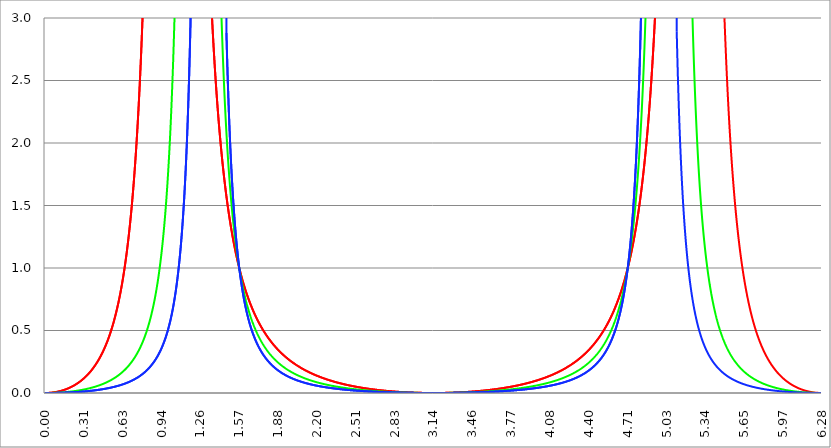
| Category | Series 1 | Series 0 | Series 2 |
|---|---|---|---|
| 0.0 | 0 | 0 | 0 |
| 0.00314159265358979 | 0 | 0 | 0 |
| 0.00628318530717958 | 0 | 0 | 0 |
| 0.00942477796076938 | 0 | 0 | 0 |
| 0.0125663706143592 | 0 | 0 | 0 |
| 0.015707963267949 | 0 | 0 | 0 |
| 0.0188495559215388 | 0 | 0 | 0 |
| 0.0219911485751285 | 0 | 0 | 0 |
| 0.0251327412287183 | 0.001 | 0 | 0 |
| 0.0282743338823081 | 0.001 | 0 | 0 |
| 0.0314159265358979 | 0.001 | 0 | 0 |
| 0.0345575191894877 | 0.001 | 0 | 0 |
| 0.0376991118430775 | 0.001 | 0 | 0 |
| 0.0408407044966673 | 0.002 | 0 | 0 |
| 0.0439822971502571 | 0.002 | 0 | 0 |
| 0.0471238898038469 | 0.002 | 0.001 | 0 |
| 0.0502654824574367 | 0.003 | 0.001 | 0 |
| 0.0534070751110265 | 0.003 | 0.001 | 0 |
| 0.0565486677646163 | 0.003 | 0.001 | 0 |
| 0.059690260418206 | 0.004 | 0.001 | 0 |
| 0.0628318530717958 | 0.004 | 0.001 | 0 |
| 0.0659734457253856 | 0.004 | 0.001 | 0 |
| 0.0691150383789754 | 0.005 | 0.001 | 0.001 |
| 0.0722566310325652 | 0.005 | 0.001 | 0.001 |
| 0.075398223686155 | 0.006 | 0.001 | 0.001 |
| 0.0785398163397448 | 0.006 | 0.002 | 0.001 |
| 0.0816814089933346 | 0.007 | 0.002 | 0.001 |
| 0.0848230016469244 | 0.007 | 0.002 | 0.001 |
| 0.0879645943005142 | 0.008 | 0.002 | 0.001 |
| 0.091106186954104 | 0.008 | 0.002 | 0.001 |
| 0.0942477796076937 | 0.009 | 0.002 | 0.001 |
| 0.0973893722612835 | 0.01 | 0.002 | 0.001 |
| 0.100530964914873 | 0.01 | 0.003 | 0.001 |
| 0.103672557568463 | 0.011 | 0.003 | 0.001 |
| 0.106814150222053 | 0.012 | 0.003 | 0.001 |
| 0.109955742875643 | 0.012 | 0.003 | 0.001 |
| 0.113097335529233 | 0.013 | 0.003 | 0.001 |
| 0.116238928182822 | 0.014 | 0.003 | 0.002 |
| 0.119380520836412 | 0.015 | 0.004 | 0.002 |
| 0.122522113490002 | 0.015 | 0.004 | 0.002 |
| 0.125663706143592 | 0.016 | 0.004 | 0.002 |
| 0.128805298797181 | 0.017 | 0.004 | 0.002 |
| 0.131946891450771 | 0.018 | 0.004 | 0.002 |
| 0.135088484104361 | 0.019 | 0.005 | 0.002 |
| 0.138230076757951 | 0.02 | 0.005 | 0.002 |
| 0.141371669411541 | 0.021 | 0.005 | 0.002 |
| 0.14451326206513 | 0.022 | 0.005 | 0.002 |
| 0.14765485471872 | 0.023 | 0.006 | 0.002 |
| 0.15079644737231 | 0.024 | 0.006 | 0.003 |
| 0.1539380400259 | 0.025 | 0.006 | 0.003 |
| 0.15707963267949 | 0.026 | 0.006 | 0.003 |
| 0.160221225333079 | 0.027 | 0.007 | 0.003 |
| 0.163362817986669 | 0.028 | 0.007 | 0.003 |
| 0.166504410640259 | 0.029 | 0.007 | 0.003 |
| 0.169646003293849 | 0.03 | 0.007 | 0.003 |
| 0.172787595947439 | 0.031 | 0.008 | 0.003 |
| 0.175929188601028 | 0.033 | 0.008 | 0.004 |
| 0.179070781254618 | 0.034 | 0.008 | 0.004 |
| 0.182212373908208 | 0.035 | 0.009 | 0.004 |
| 0.185353966561798 | 0.036 | 0.009 | 0.004 |
| 0.188495559215388 | 0.038 | 0.009 | 0.004 |
| 0.191637151868977 | 0.039 | 0.01 | 0.004 |
| 0.194778744522567 | 0.04 | 0.01 | 0.004 |
| 0.197920337176157 | 0.042 | 0.01 | 0.005 |
| 0.201061929829747 | 0.043 | 0.011 | 0.005 |
| 0.204203522483336 | 0.045 | 0.011 | 0.005 |
| 0.207345115136926 | 0.046 | 0.011 | 0.005 |
| 0.210486707790516 | 0.048 | 0.012 | 0.005 |
| 0.213628300444106 | 0.049 | 0.012 | 0.005 |
| 0.216769893097696 | 0.051 | 0.012 | 0.005 |
| 0.219911485751285 | 0.053 | 0.013 | 0.006 |
| 0.223053078404875 | 0.054 | 0.013 | 0.006 |
| 0.226194671058465 | 0.056 | 0.014 | 0.006 |
| 0.229336263712055 | 0.058 | 0.014 | 0.006 |
| 0.232477856365645 | 0.059 | 0.014 | 0.006 |
| 0.235619449019234 | 0.061 | 0.015 | 0.007 |
| 0.238761041672824 | 0.063 | 0.015 | 0.007 |
| 0.241902634326414 | 0.065 | 0.016 | 0.007 |
| 0.245044226980004 | 0.067 | 0.016 | 0.007 |
| 0.248185819633594 | 0.068 | 0.017 | 0.007 |
| 0.251327412287183 | 0.07 | 0.017 | 0.007 |
| 0.254469004940773 | 0.072 | 0.017 | 0.008 |
| 0.257610597594363 | 0.074 | 0.018 | 0.008 |
| 0.260752190247953 | 0.076 | 0.018 | 0.008 |
| 0.263893782901543 | 0.079 | 0.019 | 0.008 |
| 0.267035375555132 | 0.081 | 0.019 | 0.009 |
| 0.270176968208722 | 0.083 | 0.02 | 0.009 |
| 0.273318560862312 | 0.085 | 0.02 | 0.009 |
| 0.276460153515902 | 0.087 | 0.021 | 0.009 |
| 0.279601746169492 | 0.09 | 0.021 | 0.009 |
| 0.282743338823082 | 0.092 | 0.022 | 0.01 |
| 0.285884931476671 | 0.094 | 0.023 | 0.01 |
| 0.289026524130261 | 0.097 | 0.023 | 0.01 |
| 0.292168116783851 | 0.099 | 0.024 | 0.01 |
| 0.295309709437441 | 0.102 | 0.024 | 0.011 |
| 0.298451302091031 | 0.104 | 0.025 | 0.011 |
| 0.30159289474462 | 0.107 | 0.025 | 0.011 |
| 0.30473448739821 | 0.109 | 0.026 | 0.011 |
| 0.3078760800518 | 0.112 | 0.027 | 0.012 |
| 0.31101767270539 | 0.115 | 0.027 | 0.012 |
| 0.31415926535898 | 0.117 | 0.028 | 0.012 |
| 0.31730085801257 | 0.12 | 0.028 | 0.012 |
| 0.320442450666159 | 0.123 | 0.029 | 0.013 |
| 0.323584043319749 | 0.126 | 0.03 | 0.013 |
| 0.326725635973339 | 0.129 | 0.03 | 0.013 |
| 0.329867228626929 | 0.132 | 0.031 | 0.014 |
| 0.333008821280519 | 0.135 | 0.032 | 0.014 |
| 0.336150413934108 | 0.138 | 0.032 | 0.014 |
| 0.339292006587698 | 0.141 | 0.033 | 0.014 |
| 0.342433599241288 | 0.144 | 0.034 | 0.015 |
| 0.345575191894878 | 0.148 | 0.035 | 0.015 |
| 0.348716784548468 | 0.151 | 0.035 | 0.015 |
| 0.351858377202058 | 0.154 | 0.036 | 0.016 |
| 0.354999969855647 | 0.158 | 0.037 | 0.016 |
| 0.358141562509237 | 0.161 | 0.038 | 0.016 |
| 0.361283155162827 | 0.165 | 0.038 | 0.017 |
| 0.364424747816417 | 0.168 | 0.039 | 0.017 |
| 0.367566340470007 | 0.172 | 0.04 | 0.017 |
| 0.370707933123597 | 0.176 | 0.041 | 0.018 |
| 0.373849525777186 | 0.18 | 0.041 | 0.018 |
| 0.376991118430776 | 0.183 | 0.042 | 0.018 |
| 0.380132711084366 | 0.187 | 0.043 | 0.019 |
| 0.383274303737956 | 0.191 | 0.044 | 0.019 |
| 0.386415896391546 | 0.195 | 0.045 | 0.019 |
| 0.389557489045135 | 0.2 | 0.046 | 0.02 |
| 0.392699081698725 | 0.204 | 0.047 | 0.02 |
| 0.395840674352315 | 0.208 | 0.048 | 0.021 |
| 0.398982267005905 | 0.212 | 0.048 | 0.021 |
| 0.402123859659495 | 0.217 | 0.049 | 0.021 |
| 0.405265452313085 | 0.221 | 0.05 | 0.022 |
| 0.408407044966674 | 0.226 | 0.051 | 0.022 |
| 0.411548637620264 | 0.231 | 0.052 | 0.023 |
| 0.414690230273854 | 0.235 | 0.053 | 0.023 |
| 0.417831822927444 | 0.24 | 0.054 | 0.023 |
| 0.420973415581034 | 0.245 | 0.055 | 0.024 |
| 0.424115008234623 | 0.25 | 0.056 | 0.024 |
| 0.427256600888213 | 0.255 | 0.057 | 0.025 |
| 0.430398193541803 | 0.26 | 0.058 | 0.025 |
| 0.433539786195393 | 0.266 | 0.059 | 0.026 |
| 0.436681378848983 | 0.271 | 0.061 | 0.026 |
| 0.439822971502573 | 0.277 | 0.062 | 0.026 |
| 0.442964564156162 | 0.282 | 0.063 | 0.027 |
| 0.446106156809752 | 0.288 | 0.064 | 0.027 |
| 0.449247749463342 | 0.294 | 0.065 | 0.028 |
| 0.452389342116932 | 0.299 | 0.066 | 0.028 |
| 0.455530934770522 | 0.305 | 0.067 | 0.029 |
| 0.458672527424111 | 0.312 | 0.069 | 0.029 |
| 0.461814120077701 | 0.318 | 0.07 | 0.03 |
| 0.464955712731291 | 0.324 | 0.071 | 0.03 |
| 0.468097305384881 | 0.33 | 0.072 | 0.031 |
| 0.471238898038471 | 0.337 | 0.074 | 0.031 |
| 0.474380490692061 | 0.344 | 0.075 | 0.032 |
| 0.47752208334565 | 0.351 | 0.076 | 0.032 |
| 0.48066367599924 | 0.357 | 0.078 | 0.033 |
| 0.48380526865283 | 0.364 | 0.079 | 0.034 |
| 0.48694686130642 | 0.372 | 0.08 | 0.034 |
| 0.49008845396001 | 0.379 | 0.082 | 0.035 |
| 0.493230046613599 | 0.386 | 0.083 | 0.035 |
| 0.496371639267189 | 0.394 | 0.085 | 0.036 |
| 0.499513231920779 | 0.402 | 0.086 | 0.036 |
| 0.502654824574369 | 0.41 | 0.087 | 0.037 |
| 0.505796417227959 | 0.418 | 0.089 | 0.038 |
| 0.508938009881549 | 0.426 | 0.09 | 0.038 |
| 0.512079602535138 | 0.434 | 0.092 | 0.039 |
| 0.515221195188728 | 0.443 | 0.094 | 0.039 |
| 0.518362787842318 | 0.452 | 0.095 | 0.04 |
| 0.521504380495908 | 0.46 | 0.097 | 0.041 |
| 0.524645973149498 | 0.47 | 0.098 | 0.041 |
| 0.527787565803087 | 0.479 | 0.1 | 0.042 |
| 0.530929158456677 | 0.488 | 0.102 | 0.043 |
| 0.534070751110267 | 0.498 | 0.104 | 0.043 |
| 0.537212343763857 | 0.508 | 0.105 | 0.044 |
| 0.540353936417447 | 0.518 | 0.107 | 0.045 |
| 0.543495529071037 | 0.528 | 0.109 | 0.046 |
| 0.546637121724626 | 0.538 | 0.111 | 0.046 |
| 0.549778714378216 | 0.549 | 0.112 | 0.047 |
| 0.552920307031806 | 0.56 | 0.114 | 0.048 |
| 0.556061899685396 | 0.571 | 0.116 | 0.048 |
| 0.559203492338986 | 0.582 | 0.118 | 0.049 |
| 0.562345084992576 | 0.594 | 0.12 | 0.05 |
| 0.565486677646165 | 0.605 | 0.122 | 0.051 |
| 0.568628270299755 | 0.617 | 0.124 | 0.052 |
| 0.571769862953345 | 0.63 | 0.126 | 0.052 |
| 0.574911455606935 | 0.642 | 0.128 | 0.053 |
| 0.578053048260525 | 0.655 | 0.13 | 0.054 |
| 0.581194640914114 | 0.668 | 0.133 | 0.055 |
| 0.584336233567704 | 0.682 | 0.135 | 0.056 |
| 0.587477826221294 | 0.695 | 0.137 | 0.057 |
| 0.590619418874884 | 0.709 | 0.139 | 0.057 |
| 0.593761011528474 | 0.724 | 0.142 | 0.058 |
| 0.596902604182064 | 0.738 | 0.144 | 0.059 |
| 0.600044196835653 | 0.753 | 0.146 | 0.06 |
| 0.603185789489243 | 0.769 | 0.149 | 0.061 |
| 0.606327382142833 | 0.784 | 0.151 | 0.062 |
| 0.609468974796423 | 0.8 | 0.154 | 0.063 |
| 0.612610567450013 | 0.817 | 0.156 | 0.064 |
| 0.615752160103602 | 0.833 | 0.159 | 0.065 |
| 0.618893752757192 | 0.851 | 0.162 | 0.066 |
| 0.622035345410782 | 0.868 | 0.164 | 0.067 |
| 0.625176938064372 | 0.886 | 0.167 | 0.068 |
| 0.628318530717962 | 0.905 | 0.17 | 0.069 |
| 0.631460123371551 | 0.923 | 0.172 | 0.07 |
| 0.634601716025141 | 0.943 | 0.175 | 0.071 |
| 0.637743308678731 | 0.962 | 0.178 | 0.072 |
| 0.640884901332321 | 0.983 | 0.181 | 0.073 |
| 0.644026493985911 | 1.004 | 0.184 | 0.075 |
| 0.647168086639501 | 1.025 | 0.187 | 0.076 |
| 0.65030967929309 | 1.047 | 0.19 | 0.077 |
| 0.65345127194668 | 1.069 | 0.194 | 0.078 |
| 0.65659286460027 | 1.092 | 0.197 | 0.079 |
| 0.65973445725386 | 1.115 | 0.2 | 0.08 |
| 0.66287604990745 | 1.14 | 0.203 | 0.082 |
| 0.666017642561039 | 1.164 | 0.207 | 0.083 |
| 0.669159235214629 | 1.19 | 0.21 | 0.084 |
| 0.672300827868219 | 1.216 | 0.214 | 0.086 |
| 0.675442420521809 | 1.243 | 0.217 | 0.087 |
| 0.678584013175399 | 1.27 | 0.221 | 0.088 |
| 0.681725605828989 | 1.299 | 0.225 | 0.09 |
| 0.684867198482578 | 1.328 | 0.228 | 0.091 |
| 0.688008791136168 | 1.357 | 0.232 | 0.092 |
| 0.691150383789758 | 1.388 | 0.236 | 0.094 |
| 0.694291976443348 | 1.42 | 0.24 | 0.095 |
| 0.697433569096938 | 1.452 | 0.244 | 0.097 |
| 0.700575161750528 | 1.485 | 0.248 | 0.098 |
| 0.703716754404117 | 1.52 | 0.253 | 0.1 |
| 0.706858347057707 | 1.555 | 0.257 | 0.101 |
| 0.709999939711297 | 1.591 | 0.261 | 0.103 |
| 0.713141532364887 | 1.629 | 0.266 | 0.104 |
| 0.716283125018477 | 1.667 | 0.27 | 0.106 |
| 0.719424717672066 | 1.707 | 0.275 | 0.108 |
| 0.722566310325656 | 1.748 | 0.28 | 0.109 |
| 0.725707902979246 | 1.79 | 0.285 | 0.111 |
| 0.728849495632836 | 1.833 | 0.289 | 0.113 |
| 0.731991088286426 | 1.878 | 0.295 | 0.114 |
| 0.735132680940016 | 1.924 | 0.3 | 0.116 |
| 0.738274273593605 | 1.972 | 0.305 | 0.118 |
| 0.741415866247195 | 2.021 | 0.31 | 0.12 |
| 0.744557458900785 | 2.072 | 0.316 | 0.122 |
| 0.747699051554375 | 2.124 | 0.321 | 0.124 |
| 0.750840644207965 | 2.179 | 0.327 | 0.126 |
| 0.753982236861554 | 2.235 | 0.333 | 0.128 |
| 0.757123829515144 | 2.292 | 0.339 | 0.13 |
| 0.760265422168734 | 2.352 | 0.345 | 0.132 |
| 0.763407014822324 | 2.414 | 0.351 | 0.134 |
| 0.766548607475914 | 2.478 | 0.357 | 0.136 |
| 0.769690200129504 | 2.545 | 0.363 | 0.138 |
| 0.772831792783093 | 2.613 | 0.37 | 0.14 |
| 0.775973385436683 | 2.685 | 0.377 | 0.143 |
| 0.779114978090273 | 2.758 | 0.384 | 0.145 |
| 0.782256570743863 | 2.835 | 0.391 | 0.147 |
| 0.785398163397453 | 2.914 | 0.398 | 0.15 |
| 0.788539756051042 | 2.997 | 0.405 | 0.152 |
| 0.791681348704632 | 3.082 | 0.412 | 0.154 |
| 0.794822941358222 | 3.171 | 0.42 | 0.157 |
| 0.797964534011812 | 3.263 | 0.428 | 0.159 |
| 0.801106126665402 | 3.359 | 0.436 | 0.162 |
| 0.804247719318992 | 3.459 | 0.444 | 0.165 |
| 0.807389311972581 | 3.563 | 0.452 | 0.167 |
| 0.810530904626171 | 3.671 | 0.461 | 0.17 |
| 0.813672497279761 | 3.783 | 0.47 | 0.173 |
| 0.816814089933351 | 3.901 | 0.479 | 0.176 |
| 0.819955682586941 | 4.023 | 0.488 | 0.179 |
| 0.823097275240531 | 4.151 | 0.497 | 0.182 |
| 0.82623886789412 | 4.284 | 0.507 | 0.185 |
| 0.82938046054771 | 4.423 | 0.517 | 0.188 |
| 0.8325220532013 | 4.569 | 0.527 | 0.191 |
| 0.83566364585489 | 4.721 | 0.537 | 0.194 |
| 0.83880523850848 | 4.881 | 0.548 | 0.198 |
| 0.841946831162069 | 5.047 | 0.559 | 0.201 |
| 0.845088423815659 | 5.222 | 0.57 | 0.204 |
| 0.848230016469249 | 5.406 | 0.581 | 0.208 |
| 0.851371609122839 | 5.598 | 0.593 | 0.211 |
| 0.854513201776429 | 5.801 | 0.605 | 0.215 |
| 0.857654794430019 | 6.013 | 0.617 | 0.219 |
| 0.860796387083608 | 6.237 | 0.63 | 0.223 |
| 0.863937979737198 | 6.472 | 0.643 | 0.226 |
| 0.867079572390788 | 6.72 | 0.656 | 0.23 |
| 0.870221165044378 | 6.982 | 0.67 | 0.235 |
| 0.873362757697968 | 7.258 | 0.684 | 0.239 |
| 0.876504350351557 | 7.55 | 0.699 | 0.243 |
| 0.879645943005147 | 7.859 | 0.713 | 0.247 |
| 0.882787535658737 | 8.186 | 0.729 | 0.252 |
| 0.885929128312327 | 8.533 | 0.744 | 0.256 |
| 0.889070720965917 | 8.901 | 0.76 | 0.261 |
| 0.892212313619507 | 9.292 | 0.777 | 0.266 |
| 0.895353906273096 | 9.707 | 0.794 | 0.27 |
| 0.898495498926686 | 10.15 | 0.812 | 0.275 |
| 0.901637091580276 | 10.623 | 0.83 | 0.28 |
| 0.904778684233866 | 11.127 | 0.849 | 0.286 |
| 0.907920276887456 | 11.666 | 0.868 | 0.291 |
| 0.911061869541045 | 12.244 | 0.888 | 0.296 |
| 0.914203462194635 | 12.864 | 0.908 | 0.302 |
| 0.917345054848225 | 13.53 | 0.929 | 0.308 |
| 0.920486647501815 | 14.246 | 0.951 | 0.313 |
| 0.923628240155405 | 15.019 | 0.973 | 0.319 |
| 0.926769832808995 | 15.854 | 0.996 | 0.325 |
| 0.929911425462584 | 16.758 | 1.02 | 0.332 |
| 0.933053018116174 | 17.738 | 1.044 | 0.338 |
| 0.936194610769764 | 18.803 | 1.07 | 0.345 |
| 0.939336203423354 | 19.965 | 1.096 | 0.352 |
| 0.942477796076944 | 21.233 | 1.123 | 0.359 |
| 0.945619388730533 | 22.622 | 1.151 | 0.366 |
| 0.948760981384123 | 24.148 | 1.18 | 0.373 |
| 0.951902574037713 | 25.829 | 1.21 | 0.38 |
| 0.955044166691303 | 27.686 | 1.241 | 0.388 |
| 0.958185759344893 | 29.746 | 1.273 | 0.396 |
| 0.961327351998483 | 32.037 | 1.307 | 0.404 |
| 0.964468944652072 | 34.597 | 1.341 | 0.413 |
| 0.967610537305662 | 37.469 | 1.377 | 0.421 |
| 0.970752129959252 | 40.705 | 1.414 | 0.43 |
| 0.973893722612842 | 44.37 | 1.453 | 0.439 |
| 0.977035315266432 | 48.541 | 1.492 | 0.448 |
| 0.980176907920022 | 53.317 | 1.534 | 0.458 |
| 0.983318500573611 | 58.82 | 1.577 | 0.468 |
| 0.986460093227201 | 65.205 | 1.622 | 0.478 |
| 0.989601685880791 | 72.67 | 1.668 | 0.488 |
| 0.992743278534381 | 81.472 | 1.717 | 0.499 |
| 0.995884871187971 | 91.949 | 1.767 | 0.51 |
| 0.99902646384156 | 104.554 | 1.82 | 0.522 |
| 1.00216805649515 | 119.903 | 1.875 | 0.533 |
| 1.00530964914874 | 138.85 | 1.932 | 0.545 |
| 1.00845124180233 | 162.613 | 1.991 | 0.558 |
| 1.01159283445592 | 192.967 | 2.054 | 0.571 |
| 1.01473442710951 | 232.591 | 2.118 | 0.584 |
| 1.017876019763099 | 285.672 | 2.186 | 0.598 |
| 1.021017612416689 | 359.056 | 2.257 | 0.612 |
| 1.02415920507028 | 464.566 | 2.332 | 0.627 |
| 1.027300797723869 | 624.062 | 2.41 | 0.642 |
| 1.030442390377459 | 881.716 | 2.491 | 0.657 |
| 1.033583983031048 | 1338.161 | 2.577 | 0.673 |
| 1.036725575684638 | 2265.756 | 2.666 | 0.69 |
| 1.039867168338228 | 4632.626 | 2.761 | 0.707 |
| 1.043008760991818 | 14213.646 | 2.86 | 0.725 |
| 1.046150353645408 | 227834.643 | 2.964 | 0.744 |
| 1.049291946298998 | 57061.894 | 3.074 | 0.763 |
| 1.052433538952587 | 9146.285 | 3.19 | 0.783 |
| 1.055575131606177 | 3579.114 | 3.312 | 0.803 |
| 1.058716724259767 | 1896.414 | 3.44 | 0.825 |
| 1.061858316913357 | 1172.783 | 3.577 | 0.847 |
| 1.064999909566947 | 796.753 | 3.721 | 0.87 |
| 1.068141502220536 | 576.636 | 3.873 | 0.894 |
| 1.071283094874126 | 436.755 | 4.035 | 0.918 |
| 1.074424687527716 | 342.351 | 4.207 | 0.944 |
| 1.077566280181306 | 275.638 | 4.389 | 0.971 |
| 1.080707872834896 | 226.749 | 4.583 | 0.999 |
| 1.083849465488486 | 189.85 | 4.79 | 1.028 |
| 1.086991058142075 | 161.315 | 5.011 | 1.058 |
| 1.090132650795665 | 138.791 | 5.247 | 1.09 |
| 1.093274243449255 | 120.699 | 5.499 | 1.122 |
| 1.096415836102845 | 105.946 | 5.769 | 1.157 |
| 1.099557428756435 | 93.758 | 6.059 | 1.192 |
| 1.102699021410025 | 83.57 | 6.371 | 1.23 |
| 1.105840614063614 | 74.969 | 6.707 | 1.269 |
| 1.108982206717204 | 67.639 | 7.069 | 1.31 |
| 1.112123799370794 | 61.341 | 7.46 | 1.352 |
| 1.115265392024384 | 55.89 | 7.885 | 1.397 |
| 1.118406984677974 | 51.141 | 8.345 | 1.444 |
| 1.121548577331563 | 46.977 | 8.846 | 1.493 |
| 1.124690169985153 | 43.306 | 9.392 | 1.545 |
| 1.127831762638743 | 40.052 | 9.989 | 1.599 |
| 1.130973355292333 | 37.155 | 10.644 | 1.656 |
| 1.134114947945923 | 34.565 | 11.364 | 1.716 |
| 1.137256540599513 | 32.238 | 12.158 | 1.779 |
| 1.140398133253102 | 30.141 | 13.037 | 1.846 |
| 1.143539725906692 | 28.244 | 14.013 | 1.916 |
| 1.146681318560282 | 26.523 | 15.1 | 1.99 |
| 1.149822911213872 | 24.955 | 16.317 | 2.068 |
| 1.152964503867462 | 23.524 | 17.684 | 2.151 |
| 1.156106096521051 | 22.214 | 19.229 | 2.239 |
| 1.159247689174641 | 21.012 | 20.981 | 2.332 |
| 1.162389281828231 | 19.905 | 22.981 | 2.431 |
| 1.165530874481821 | 18.885 | 25.277 | 2.536 |
| 1.168672467135411 | 17.942 | 27.931 | 2.648 |
| 1.171814059789001 | 17.068 | 31.021 | 2.767 |
| 1.17495565244259 | 16.258 | 34.647 | 2.894 |
| 1.17809724509618 | 15.504 | 38.941 | 3.03 |
| 1.18123883774977 | 14.803 | 44.078 | 3.176 |
| 1.18438043040336 | 14.148 | 50.292 | 3.331 |
| 1.18752202305695 | 13.536 | 57.907 | 3.499 |
| 1.190663615710539 | 12.964 | 67.376 | 3.678 |
| 1.193805208364129 | 12.427 | 79.355 | 3.872 |
| 1.19694680101772 | 11.924 | 94.813 | 4.081 |
| 1.200088393671309 | 11.45 | 115.238 | 4.307 |
| 1.203229986324899 | 11.005 | 143.008 | 4.552 |
| 1.206371578978489 | 10.585 | 182.113 | 4.818 |
| 1.209513171632078 | 10.189 | 239.667 | 5.108 |
| 1.212654764285668 | 9.816 | 329.392 | 5.424 |
| 1.215796356939258 | 9.462 | 480.595 | 5.77 |
| 1.218937949592848 | 9.128 | 765.506 | 6.149 |
| 1.222079542246438 | 8.811 | 1404.605 | 6.566 |
| 1.225221134900027 | 8.51 | 3367.454 | 7.026 |
| 1.228362727553617 | 8.225 | 16463.282 | 7.536 |
| 1.231504320207207 | 7.954 | 374285.39 | 8.103 |
| 1.234645912860797 | 7.696 | 8186.375 | 8.735 |
| 1.237787505514387 | 7.451 | 2388.869 | 9.442 |
| 1.240929098167977 | 7.217 | 1121.742 | 10.239 |
| 1.244070690821566 | 6.994 | 649.269 | 11.139 |
| 1.247212283475156 | 6.782 | 422.967 | 12.162 |
| 1.250353876128746 | 6.579 | 297.342 | 13.331 |
| 1.253495468782336 | 6.385 | 220.443 | 14.675 |
| 1.256637061435926 | 6.2 | 169.971 | 16.231 |
| 1.259778654089515 | 6.022 | 135.066 | 18.046 |
| 1.262920246743105 | 5.852 | 109.925 | 20.18 |
| 1.266061839396695 | 5.69 | 91.216 | 22.713 |
| 1.269203432050285 | 5.534 | 76.918 | 25.751 |
| 1.272345024703875 | 5.384 | 65.744 | 29.438 |
| 1.275486617357465 | 5.24 | 56.846 | 33.971 |
| 1.278628210011054 | 5.102 | 49.644 | 39.631 |
| 1.281769802664644 | 4.97 | 43.733 | 46.824 |
| 1.284911395318234 | 4.842 | 38.822 | 56.158 |
| 1.288052987971824 | 4.72 | 34.697 | 68.574 |
| 1.291194580625414 | 4.602 | 31.198 | 85.593 |
| 1.294336173279003 | 4.488 | 28.205 | 109.804 |
| 1.297477765932593 | 4.379 | 25.624 | 145.91 |
| 1.300619358586183 | 4.273 | 23.384 | 203.193 |
| 1.303760951239773 | 4.172 | 21.426 | 302.129 |
| 1.306902543893363 | 4.073 | 19.705 | 495.563 |
| 1.310044136546953 | 3.979 | 18.184 | 957.192 |
| 1.313185729200542 | 3.887 | 16.834 | 2567.825 |
| 1.316327321854132 | 3.799 | 15.629 | 19524.47 |
| 1.319468914507722 | 3.714 | 14.549 | 34161.462 |
| 1.322610507161312 | 3.631 | 13.578 | 3097.615 |
| 1.325752099814902 | 3.551 | 12.702 | 1073.948 |
| 1.328893692468491 | 3.474 | 11.908 | 539.519 |
| 1.332035285122081 | 3.399 | 11.187 | 323.706 |
| 1.335176877775671 | 3.327 | 10.529 | 215.627 |
| 1.338318470429261 | 3.257 | 9.928 | 153.891 |
| 1.341460063082851 | 3.189 | 9.377 | 115.34 |
| 1.344601655736441 | 3.123 | 8.871 | 89.663 |
| 1.34774324839003 | 3.059 | 8.405 | 71.705 |
| 1.35088484104362 | 2.997 | 7.975 | 58.655 |
| 1.35402643369721 | 2.937 | 7.578 | 48.873 |
| 1.3571680263508 | 2.879 | 7.209 | 41.353 |
| 1.36030961900439 | 2.822 | 6.867 | 35.446 |
| 1.363451211657979 | 2.767 | 6.548 | 30.723 |
| 1.36659280431157 | 2.714 | 6.252 | 26.886 |
| 1.369734396965159 | 2.662 | 5.975 | 23.727 |
| 1.372875989618749 | 2.611 | 5.716 | 21.095 |
| 1.376017582272339 | 2.562 | 5.473 | 18.878 |
| 1.379159174925929 | 2.515 | 5.246 | 16.994 |
| 1.382300767579518 | 2.468 | 5.033 | 15.38 |
| 1.385442360233108 | 2.423 | 4.832 | 13.985 |
| 1.388583952886698 | 2.379 | 4.643 | 12.773 |
| 1.391725545540288 | 2.336 | 4.466 | 11.711 |
| 1.394867138193878 | 2.295 | 4.298 | 10.777 |
| 1.398008730847468 | 2.254 | 4.139 | 9.951 |
| 1.401150323501057 | 2.215 | 3.989 | 9.217 |
| 1.404291916154647 | 2.176 | 3.847 | 8.561 |
| 1.407433508808237 | 2.138 | 3.713 | 7.972 |
| 1.410575101461827 | 2.102 | 3.585 | 7.443 |
| 1.413716694115417 | 2.066 | 3.464 | 6.964 |
| 1.416858286769006 | 2.031 | 3.349 | 6.531 |
| 1.419999879422596 | 1.997 | 3.239 | 6.137 |
| 1.423141472076186 | 1.964 | 3.135 | 5.777 |
| 1.426283064729776 | 1.932 | 3.036 | 5.448 |
| 1.429424657383366 | 1.9 | 2.941 | 5.147 |
| 1.432566250036956 | 1.869 | 2.851 | 4.87 |
| 1.435707842690545 | 1.839 | 2.764 | 4.614 |
| 1.438849435344135 | 1.81 | 2.682 | 4.379 |
| 1.441991027997725 | 1.781 | 2.603 | 4.16 |
| 1.445132620651315 | 1.753 | 2.528 | 3.958 |
| 1.448274213304905 | 1.726 | 2.456 | 3.77 |
| 1.451415805958494 | 1.699 | 2.387 | 3.596 |
| 1.454557398612084 | 1.672 | 2.32 | 3.433 |
| 1.457698991265674 | 1.647 | 2.257 | 3.281 |
| 1.460840583919264 | 1.622 | 2.196 | 3.138 |
| 1.463982176572854 | 1.597 | 2.137 | 3.005 |
| 1.467123769226444 | 1.573 | 2.081 | 2.88 |
| 1.470265361880033 | 1.55 | 2.027 | 2.763 |
| 1.473406954533623 | 1.527 | 1.974 | 2.653 |
| 1.476548547187213 | 1.504 | 1.924 | 2.549 |
| 1.479690139840803 | 1.482 | 1.876 | 2.451 |
| 1.482831732494393 | 1.46 | 1.83 | 2.359 |
| 1.485973325147982 | 1.439 | 1.785 | 2.272 |
| 1.489114917801572 | 1.419 | 1.742 | 2.189 |
| 1.492256510455162 | 1.398 | 1.7 | 2.111 |
| 1.495398103108752 | 1.378 | 1.66 | 2.037 |
| 1.498539695762342 | 1.359 | 1.621 | 1.967 |
| 1.501681288415932 | 1.34 | 1.583 | 1.9 |
| 1.504822881069521 | 1.321 | 1.547 | 1.837 |
| 1.507964473723111 | 1.303 | 1.512 | 1.776 |
| 1.511106066376701 | 1.285 | 1.478 | 1.719 |
| 1.514247659030291 | 1.267 | 1.445 | 1.664 |
| 1.517389251683881 | 1.25 | 1.414 | 1.612 |
| 1.520530844337471 | 1.233 | 1.383 | 1.562 |
| 1.52367243699106 | 1.216 | 1.353 | 1.515 |
| 1.52681402964465 | 1.2 | 1.324 | 1.47 |
| 1.52995562229824 | 1.184 | 1.296 | 1.426 |
| 1.53309721495183 | 1.168 | 1.269 | 1.385 |
| 1.53623880760542 | 1.153 | 1.243 | 1.345 |
| 1.539380400259009 | 1.137 | 1.218 | 1.307 |
| 1.542521992912599 | 1.123 | 1.193 | 1.27 |
| 1.545663585566189 | 1.108 | 1.169 | 1.235 |
| 1.548805178219779 | 1.094 | 1.146 | 1.202 |
| 1.551946770873369 | 1.079 | 1.123 | 1.169 |
| 1.555088363526959 | 1.066 | 1.101 | 1.138 |
| 1.558229956180548 | 1.052 | 1.08 | 1.108 |
| 1.561371548834138 | 1.039 | 1.059 | 1.08 |
| 1.564513141487728 | 1.026 | 1.039 | 1.052 |
| 1.567654734141318 | 1.013 | 1.019 | 1.026 |
| 1.570796326794908 | 1 | 1 | 1 |
| 1.573937919448497 | 0.988 | 0.981 | 0.975 |
| 1.577079512102087 | 0.975 | 0.963 | 0.952 |
| 1.580221104755677 | 0.963 | 0.946 | 0.929 |
| 1.583362697409267 | 0.951 | 0.929 | 0.906 |
| 1.586504290062857 | 0.94 | 0.912 | 0.885 |
| 1.589645882716447 | 0.928 | 0.896 | 0.864 |
| 1.592787475370036 | 0.917 | 0.88 | 0.844 |
| 1.595929068023626 | 0.906 | 0.864 | 0.825 |
| 1.599070660677216 | 0.895 | 0.849 | 0.806 |
| 1.602212253330806 | 0.884 | 0.834 | 0.788 |
| 1.605353845984396 | 0.874 | 0.82 | 0.771 |
| 1.608495438637985 | 0.863 | 0.806 | 0.754 |
| 1.611637031291575 | 0.853 | 0.792 | 0.738 |
| 1.614778623945165 | 0.843 | 0.779 | 0.722 |
| 1.617920216598755 | 0.833 | 0.766 | 0.706 |
| 1.621061809252345 | 0.824 | 0.753 | 0.692 |
| 1.624203401905935 | 0.814 | 0.741 | 0.677 |
| 1.627344994559524 | 0.805 | 0.729 | 0.663 |
| 1.630486587213114 | 0.795 | 0.717 | 0.649 |
| 1.633628179866704 | 0.786 | 0.705 | 0.636 |
| 1.636769772520294 | 0.777 | 0.694 | 0.623 |
| 1.639911365173884 | 0.768 | 0.683 | 0.611 |
| 1.643052957827473 | 0.76 | 0.672 | 0.599 |
| 1.646194550481063 | 0.751 | 0.662 | 0.587 |
| 1.649336143134653 | 0.743 | 0.651 | 0.576 |
| 1.652477735788243 | 0.734 | 0.641 | 0.565 |
| 1.655619328441833 | 0.726 | 0.631 | 0.554 |
| 1.658760921095423 | 0.718 | 0.622 | 0.543 |
| 1.661902513749012 | 0.71 | 0.612 | 0.533 |
| 1.665044106402602 | 0.702 | 0.603 | 0.523 |
| 1.668185699056192 | 0.694 | 0.594 | 0.513 |
| 1.671327291709782 | 0.687 | 0.585 | 0.504 |
| 1.674468884363372 | 0.679 | 0.576 | 0.495 |
| 1.677610477016961 | 0.672 | 0.568 | 0.486 |
| 1.680752069670551 | 0.664 | 0.559 | 0.477 |
| 1.683893662324141 | 0.657 | 0.551 | 0.469 |
| 1.687035254977731 | 0.65 | 0.543 | 0.46 |
| 1.690176847631321 | 0.643 | 0.535 | 0.452 |
| 1.693318440284911 | 0.636 | 0.527 | 0.444 |
| 1.6964600329385 | 0.629 | 0.52 | 0.437 |
| 1.69960162559209 | 0.623 | 0.512 | 0.429 |
| 1.70274321824568 | 0.616 | 0.505 | 0.422 |
| 1.70588481089927 | 0.609 | 0.498 | 0.415 |
| 1.70902640355286 | 0.603 | 0.491 | 0.408 |
| 1.712167996206449 | 0.597 | 0.484 | 0.401 |
| 1.715309588860039 | 0.59 | 0.478 | 0.394 |
| 1.71845118151363 | 0.584 | 0.471 | 0.388 |
| 1.721592774167219 | 0.578 | 0.464 | 0.381 |
| 1.724734366820809 | 0.572 | 0.458 | 0.375 |
| 1.727875959474399 | 0.566 | 0.452 | 0.369 |
| 1.731017552127988 | 0.56 | 0.446 | 0.363 |
| 1.734159144781578 | 0.554 | 0.44 | 0.357 |
| 1.737300737435168 | 0.549 | 0.434 | 0.352 |
| 1.740442330088758 | 0.543 | 0.428 | 0.346 |
| 1.743583922742348 | 0.537 | 0.422 | 0.341 |
| 1.746725515395937 | 0.532 | 0.417 | 0.335 |
| 1.749867108049527 | 0.526 | 0.411 | 0.33 |
| 1.753008700703117 | 0.521 | 0.406 | 0.325 |
| 1.756150293356707 | 0.516 | 0.401 | 0.32 |
| 1.759291886010297 | 0.511 | 0.395 | 0.315 |
| 1.762433478663887 | 0.505 | 0.39 | 0.31 |
| 1.765575071317476 | 0.5 | 0.385 | 0.306 |
| 1.768716663971066 | 0.495 | 0.38 | 0.301 |
| 1.771858256624656 | 0.49 | 0.375 | 0.297 |
| 1.774999849278246 | 0.485 | 0.371 | 0.292 |
| 1.778141441931836 | 0.48 | 0.366 | 0.288 |
| 1.781283034585426 | 0.476 | 0.361 | 0.284 |
| 1.784424627239015 | 0.471 | 0.357 | 0.28 |
| 1.787566219892605 | 0.466 | 0.352 | 0.276 |
| 1.790707812546195 | 0.462 | 0.348 | 0.272 |
| 1.793849405199785 | 0.457 | 0.344 | 0.268 |
| 1.796990997853375 | 0.453 | 0.339 | 0.264 |
| 1.800132590506964 | 0.448 | 0.335 | 0.26 |
| 1.803274183160554 | 0.444 | 0.331 | 0.256 |
| 1.806415775814144 | 0.439 | 0.327 | 0.253 |
| 1.809557368467734 | 0.435 | 0.323 | 0.249 |
| 1.812698961121324 | 0.431 | 0.319 | 0.246 |
| 1.815840553774914 | 0.427 | 0.315 | 0.242 |
| 1.818982146428503 | 0.423 | 0.311 | 0.239 |
| 1.822123739082093 | 0.418 | 0.308 | 0.236 |
| 1.825265331735683 | 0.414 | 0.304 | 0.233 |
| 1.828406924389273 | 0.41 | 0.3 | 0.229 |
| 1.831548517042863 | 0.406 | 0.297 | 0.226 |
| 1.834690109696452 | 0.402 | 0.293 | 0.223 |
| 1.837831702350042 | 0.399 | 0.29 | 0.22 |
| 1.840973295003632 | 0.395 | 0.286 | 0.217 |
| 1.844114887657222 | 0.391 | 0.283 | 0.214 |
| 1.847256480310812 | 0.387 | 0.28 | 0.212 |
| 1.850398072964402 | 0.384 | 0.276 | 0.209 |
| 1.853539665617991 | 0.38 | 0.273 | 0.206 |
| 1.856681258271581 | 0.376 | 0.27 | 0.203 |
| 1.859822850925171 | 0.373 | 0.267 | 0.201 |
| 1.862964443578761 | 0.369 | 0.264 | 0.198 |
| 1.866106036232351 | 0.366 | 0.261 | 0.195 |
| 1.86924762888594 | 0.362 | 0.258 | 0.193 |
| 1.87238922153953 | 0.359 | 0.255 | 0.19 |
| 1.87553081419312 | 0.355 | 0.252 | 0.188 |
| 1.87867240684671 | 0.352 | 0.249 | 0.186 |
| 1.8818139995003 | 0.349 | 0.246 | 0.183 |
| 1.88495559215389 | 0.345 | 0.244 | 0.181 |
| 1.888097184807479 | 0.342 | 0.241 | 0.179 |
| 1.891238777461069 | 0.339 | 0.238 | 0.176 |
| 1.89438037011466 | 0.336 | 0.235 | 0.174 |
| 1.897521962768249 | 0.333 | 0.233 | 0.172 |
| 1.900663555421839 | 0.33 | 0.23 | 0.17 |
| 1.903805148075429 | 0.327 | 0.228 | 0.168 |
| 1.906946740729018 | 0.324 | 0.225 | 0.166 |
| 1.910088333382608 | 0.321 | 0.223 | 0.164 |
| 1.913229926036198 | 0.318 | 0.22 | 0.162 |
| 1.916371518689788 | 0.315 | 0.218 | 0.16 |
| 1.919513111343378 | 0.312 | 0.215 | 0.158 |
| 1.922654703996967 | 0.309 | 0.213 | 0.156 |
| 1.925796296650557 | 0.306 | 0.211 | 0.154 |
| 1.928937889304147 | 0.303 | 0.208 | 0.152 |
| 1.932079481957737 | 0.3 | 0.206 | 0.15 |
| 1.935221074611327 | 0.298 | 0.204 | 0.148 |
| 1.938362667264917 | 0.295 | 0.202 | 0.147 |
| 1.941504259918506 | 0.292 | 0.199 | 0.145 |
| 1.944645852572096 | 0.289 | 0.197 | 0.143 |
| 1.947787445225686 | 0.287 | 0.195 | 0.141 |
| 1.950929037879276 | 0.284 | 0.193 | 0.14 |
| 1.954070630532866 | 0.282 | 0.191 | 0.138 |
| 1.957212223186455 | 0.279 | 0.189 | 0.136 |
| 1.960353815840045 | 0.276 | 0.187 | 0.135 |
| 1.963495408493635 | 0.274 | 0.185 | 0.133 |
| 1.966637001147225 | 0.271 | 0.183 | 0.132 |
| 1.969778593800815 | 0.269 | 0.181 | 0.13 |
| 1.972920186454405 | 0.266 | 0.179 | 0.129 |
| 1.976061779107994 | 0.264 | 0.177 | 0.127 |
| 1.979203371761584 | 0.262 | 0.175 | 0.126 |
| 1.982344964415174 | 0.259 | 0.174 | 0.124 |
| 1.985486557068764 | 0.257 | 0.172 | 0.123 |
| 1.988628149722354 | 0.255 | 0.17 | 0.121 |
| 1.991769742375943 | 0.252 | 0.168 | 0.12 |
| 1.994911335029533 | 0.25 | 0.166 | 0.119 |
| 1.998052927683123 | 0.248 | 0.165 | 0.117 |
| 2.001194520336712 | 0.245 | 0.163 | 0.116 |
| 2.004336112990302 | 0.243 | 0.161 | 0.115 |
| 2.007477705643892 | 0.241 | 0.16 | 0.113 |
| 2.010619298297482 | 0.239 | 0.158 | 0.112 |
| 2.013760890951071 | 0.237 | 0.156 | 0.111 |
| 2.016902483604661 | 0.235 | 0.155 | 0.11 |
| 2.02004407625825 | 0.232 | 0.153 | 0.108 |
| 2.02318566891184 | 0.23 | 0.151 | 0.107 |
| 2.02632726156543 | 0.228 | 0.15 | 0.106 |
| 2.029468854219019 | 0.226 | 0.148 | 0.105 |
| 2.032610446872609 | 0.224 | 0.147 | 0.104 |
| 2.035752039526198 | 0.222 | 0.145 | 0.102 |
| 2.038893632179788 | 0.22 | 0.144 | 0.101 |
| 2.042035224833378 | 0.218 | 0.142 | 0.1 |
| 2.045176817486967 | 0.216 | 0.141 | 0.099 |
| 2.048318410140557 | 0.214 | 0.139 | 0.098 |
| 2.051460002794146 | 0.212 | 0.138 | 0.097 |
| 2.054601595447736 | 0.21 | 0.137 | 0.096 |
| 2.057743188101325 | 0.208 | 0.135 | 0.095 |
| 2.060884780754915 | 0.207 | 0.134 | 0.094 |
| 2.064026373408505 | 0.205 | 0.132 | 0.093 |
| 2.067167966062094 | 0.203 | 0.131 | 0.092 |
| 2.070309558715684 | 0.201 | 0.13 | 0.091 |
| 2.073451151369273 | 0.199 | 0.128 | 0.09 |
| 2.076592744022863 | 0.197 | 0.127 | 0.089 |
| 2.079734336676452 | 0.196 | 0.126 | 0.088 |
| 2.082875929330042 | 0.194 | 0.125 | 0.087 |
| 2.086017521983632 | 0.192 | 0.123 | 0.086 |
| 2.089159114637221 | 0.19 | 0.122 | 0.085 |
| 2.092300707290811 | 0.189 | 0.121 | 0.084 |
| 2.095442299944401 | 0.187 | 0.12 | 0.083 |
| 2.09858389259799 | 0.185 | 0.118 | 0.082 |
| 2.10172548525158 | 0.184 | 0.117 | 0.081 |
| 2.104867077905169 | 0.182 | 0.116 | 0.08 |
| 2.108008670558759 | 0.18 | 0.115 | 0.08 |
| 2.111150263212349 | 0.179 | 0.114 | 0.079 |
| 2.114291855865938 | 0.177 | 0.113 | 0.078 |
| 2.117433448519528 | 0.175 | 0.111 | 0.077 |
| 2.120575041173117 | 0.174 | 0.11 | 0.076 |
| 2.123716633826707 | 0.172 | 0.109 | 0.075 |
| 2.126858226480297 | 0.171 | 0.108 | 0.075 |
| 2.129999819133886 | 0.169 | 0.107 | 0.074 |
| 2.133141411787476 | 0.168 | 0.106 | 0.073 |
| 2.136283004441065 | 0.166 | 0.105 | 0.072 |
| 2.139424597094655 | 0.165 | 0.104 | 0.071 |
| 2.142566189748245 | 0.163 | 0.103 | 0.071 |
| 2.145707782401834 | 0.162 | 0.102 | 0.07 |
| 2.148849375055424 | 0.16 | 0.101 | 0.069 |
| 2.151990967709013 | 0.159 | 0.1 | 0.068 |
| 2.155132560362603 | 0.157 | 0.099 | 0.068 |
| 2.158274153016193 | 0.156 | 0.098 | 0.067 |
| 2.161415745669782 | 0.154 | 0.097 | 0.066 |
| 2.164557338323372 | 0.153 | 0.096 | 0.066 |
| 2.167698930976961 | 0.152 | 0.095 | 0.065 |
| 2.170840523630551 | 0.15 | 0.094 | 0.064 |
| 2.173982116284141 | 0.149 | 0.093 | 0.063 |
| 2.17712370893773 | 0.147 | 0.092 | 0.063 |
| 2.18026530159132 | 0.146 | 0.091 | 0.062 |
| 2.183406894244909 | 0.145 | 0.09 | 0.061 |
| 2.186548486898499 | 0.143 | 0.089 | 0.061 |
| 2.189690079552089 | 0.142 | 0.088 | 0.06 |
| 2.192831672205678 | 0.141 | 0.087 | 0.06 |
| 2.195973264859268 | 0.14 | 0.087 | 0.059 |
| 2.199114857512857 | 0.138 | 0.086 | 0.058 |
| 2.202256450166447 | 0.137 | 0.085 | 0.058 |
| 2.205398042820036 | 0.136 | 0.084 | 0.057 |
| 2.208539635473626 | 0.134 | 0.083 | 0.056 |
| 2.211681228127216 | 0.133 | 0.082 | 0.056 |
| 2.214822820780805 | 0.132 | 0.081 | 0.055 |
| 2.217964413434395 | 0.131 | 0.081 | 0.055 |
| 2.221106006087984 | 0.13 | 0.08 | 0.054 |
| 2.224247598741574 | 0.128 | 0.079 | 0.054 |
| 2.227389191395164 | 0.127 | 0.078 | 0.053 |
| 2.230530784048753 | 0.126 | 0.077 | 0.052 |
| 2.233672376702343 | 0.125 | 0.077 | 0.052 |
| 2.236813969355933 | 0.124 | 0.076 | 0.051 |
| 2.239955562009522 | 0.123 | 0.075 | 0.051 |
| 2.243097154663112 | 0.121 | 0.074 | 0.05 |
| 2.246238747316701 | 0.12 | 0.074 | 0.05 |
| 2.249380339970291 | 0.119 | 0.073 | 0.049 |
| 2.252521932623881 | 0.118 | 0.072 | 0.049 |
| 2.25566352527747 | 0.117 | 0.071 | 0.048 |
| 2.25880511793106 | 0.116 | 0.071 | 0.048 |
| 2.261946710584649 | 0.115 | 0.07 | 0.047 |
| 2.265088303238239 | 0.114 | 0.069 | 0.047 |
| 2.268229895891829 | 0.113 | 0.069 | 0.046 |
| 2.271371488545418 | 0.112 | 0.068 | 0.046 |
| 2.274513081199008 | 0.11 | 0.067 | 0.045 |
| 2.277654673852597 | 0.109 | 0.067 | 0.045 |
| 2.280796266506186 | 0.108 | 0.066 | 0.044 |
| 2.283937859159776 | 0.107 | 0.065 | 0.044 |
| 2.287079451813366 | 0.106 | 0.065 | 0.043 |
| 2.290221044466955 | 0.105 | 0.064 | 0.043 |
| 2.293362637120545 | 0.104 | 0.063 | 0.042 |
| 2.296504229774135 | 0.103 | 0.063 | 0.042 |
| 2.299645822427724 | 0.102 | 0.062 | 0.041 |
| 2.302787415081314 | 0.101 | 0.061 | 0.041 |
| 2.305929007734904 | 0.1 | 0.061 | 0.041 |
| 2.309070600388493 | 0.099 | 0.06 | 0.04 |
| 2.312212193042083 | 0.098 | 0.059 | 0.04 |
| 2.315353785695672 | 0.097 | 0.059 | 0.039 |
| 2.318495378349262 | 0.097 | 0.058 | 0.039 |
| 2.321636971002852 | 0.096 | 0.058 | 0.038 |
| 2.324778563656441 | 0.095 | 0.057 | 0.038 |
| 2.327920156310031 | 0.094 | 0.056 | 0.038 |
| 2.33106174896362 | 0.093 | 0.056 | 0.037 |
| 2.33420334161721 | 0.092 | 0.055 | 0.037 |
| 2.3373449342708 | 0.091 | 0.055 | 0.036 |
| 2.340486526924389 | 0.09 | 0.054 | 0.036 |
| 2.343628119577979 | 0.089 | 0.054 | 0.036 |
| 2.346769712231568 | 0.088 | 0.053 | 0.035 |
| 2.349911304885158 | 0.088 | 0.052 | 0.035 |
| 2.353052897538748 | 0.087 | 0.052 | 0.034 |
| 2.356194490192337 | 0.086 | 0.051 | 0.034 |
| 2.359336082845927 | 0.085 | 0.051 | 0.034 |
| 2.362477675499516 | 0.084 | 0.05 | 0.033 |
| 2.365619268153106 | 0.083 | 0.05 | 0.033 |
| 2.368760860806696 | 0.082 | 0.049 | 0.033 |
| 2.371902453460285 | 0.082 | 0.049 | 0.032 |
| 2.375044046113875 | 0.081 | 0.048 | 0.032 |
| 2.378185638767464 | 0.08 | 0.048 | 0.032 |
| 2.381327231421054 | 0.079 | 0.047 | 0.031 |
| 2.384468824074644 | 0.078 | 0.047 | 0.031 |
| 2.387610416728233 | 0.078 | 0.046 | 0.031 |
| 2.390752009381823 | 0.077 | 0.046 | 0.03 |
| 2.393893602035412 | 0.076 | 0.045 | 0.03 |
| 2.397035194689002 | 0.075 | 0.045 | 0.03 |
| 2.400176787342591 | 0.074 | 0.044 | 0.029 |
| 2.403318379996181 | 0.074 | 0.044 | 0.029 |
| 2.406459972649771 | 0.073 | 0.043 | 0.029 |
| 2.40960156530336 | 0.072 | 0.043 | 0.028 |
| 2.41274315795695 | 0.071 | 0.042 | 0.028 |
| 2.41588475061054 | 0.071 | 0.042 | 0.028 |
| 2.419026343264129 | 0.07 | 0.041 | 0.027 |
| 2.422167935917719 | 0.069 | 0.041 | 0.027 |
| 2.425309528571308 | 0.069 | 0.04 | 0.027 |
| 2.428451121224898 | 0.068 | 0.04 | 0.026 |
| 2.431592713878488 | 0.067 | 0.04 | 0.026 |
| 2.434734306532077 | 0.066 | 0.039 | 0.026 |
| 2.437875899185667 | 0.066 | 0.039 | 0.026 |
| 2.441017491839256 | 0.065 | 0.038 | 0.025 |
| 2.444159084492846 | 0.064 | 0.038 | 0.025 |
| 2.447300677146435 | 0.064 | 0.037 | 0.025 |
| 2.450442269800025 | 0.063 | 0.037 | 0.024 |
| 2.453583862453615 | 0.062 | 0.037 | 0.024 |
| 2.456725455107204 | 0.062 | 0.036 | 0.024 |
| 2.459867047760794 | 0.061 | 0.036 | 0.024 |
| 2.463008640414384 | 0.06 | 0.035 | 0.023 |
| 2.466150233067973 | 0.06 | 0.035 | 0.023 |
| 2.469291825721563 | 0.059 | 0.035 | 0.023 |
| 2.472433418375152 | 0.058 | 0.034 | 0.022 |
| 2.475575011028742 | 0.058 | 0.034 | 0.022 |
| 2.478716603682332 | 0.057 | 0.033 | 0.022 |
| 2.481858196335921 | 0.056 | 0.033 | 0.022 |
| 2.48499978898951 | 0.056 | 0.033 | 0.021 |
| 2.4881413816431 | 0.055 | 0.032 | 0.021 |
| 2.49128297429669 | 0.055 | 0.032 | 0.021 |
| 2.49442456695028 | 0.054 | 0.032 | 0.021 |
| 2.497566159603869 | 0.053 | 0.031 | 0.02 |
| 2.500707752257458 | 0.053 | 0.031 | 0.02 |
| 2.503849344911048 | 0.052 | 0.03 | 0.02 |
| 2.506990937564638 | 0.052 | 0.03 | 0.02 |
| 2.510132530218228 | 0.051 | 0.03 | 0.019 |
| 2.513274122871817 | 0.05 | 0.029 | 0.019 |
| 2.516415715525407 | 0.05 | 0.029 | 0.019 |
| 2.519557308178996 | 0.049 | 0.029 | 0.019 |
| 2.522698900832586 | 0.049 | 0.028 | 0.019 |
| 2.525840493486176 | 0.048 | 0.028 | 0.018 |
| 2.528982086139765 | 0.048 | 0.028 | 0.018 |
| 2.532123678793355 | 0.047 | 0.027 | 0.018 |
| 2.535265271446944 | 0.046 | 0.027 | 0.018 |
| 2.538406864100534 | 0.046 | 0.027 | 0.017 |
| 2.541548456754124 | 0.045 | 0.026 | 0.017 |
| 2.544690049407713 | 0.045 | 0.026 | 0.017 |
| 2.547831642061302 | 0.044 | 0.026 | 0.017 |
| 2.550973234714892 | 0.044 | 0.025 | 0.017 |
| 2.554114827368482 | 0.043 | 0.025 | 0.016 |
| 2.557256420022072 | 0.043 | 0.025 | 0.016 |
| 2.560398012675661 | 0.042 | 0.025 | 0.016 |
| 2.563539605329251 | 0.042 | 0.024 | 0.016 |
| 2.56668119798284 | 0.041 | 0.024 | 0.016 |
| 2.56982279063643 | 0.041 | 0.024 | 0.015 |
| 2.57296438329002 | 0.04 | 0.023 | 0.015 |
| 2.576105975943609 | 0.04 | 0.023 | 0.015 |
| 2.579247568597199 | 0.039 | 0.023 | 0.015 |
| 2.582389161250788 | 0.039 | 0.022 | 0.015 |
| 2.585530753904377 | 0.038 | 0.022 | 0.014 |
| 2.588672346557967 | 0.038 | 0.022 | 0.014 |
| 2.591813939211557 | 0.037 | 0.022 | 0.014 |
| 2.594955531865147 | 0.037 | 0.021 | 0.014 |
| 2.598097124518736 | 0.036 | 0.021 | 0.014 |
| 2.601238717172326 | 0.036 | 0.021 | 0.013 |
| 2.604380309825915 | 0.035 | 0.02 | 0.013 |
| 2.607521902479505 | 0.035 | 0.02 | 0.013 |
| 2.610663495133095 | 0.035 | 0.02 | 0.013 |
| 2.613805087786684 | 0.034 | 0.02 | 0.013 |
| 2.616946680440274 | 0.034 | 0.019 | 0.013 |
| 2.620088273093863 | 0.033 | 0.019 | 0.012 |
| 2.623229865747452 | 0.033 | 0.019 | 0.012 |
| 2.626371458401042 | 0.032 | 0.019 | 0.012 |
| 2.629513051054632 | 0.032 | 0.018 | 0.012 |
| 2.632654643708222 | 0.031 | 0.018 | 0.012 |
| 2.635796236361811 | 0.031 | 0.018 | 0.012 |
| 2.638937829015401 | 0.031 | 0.018 | 0.011 |
| 2.642079421668991 | 0.03 | 0.017 | 0.011 |
| 2.64522101432258 | 0.03 | 0.017 | 0.011 |
| 2.64836260697617 | 0.029 | 0.017 | 0.011 |
| 2.651504199629759 | 0.029 | 0.017 | 0.011 |
| 2.654645792283349 | 0.029 | 0.016 | 0.011 |
| 2.657787384936938 | 0.028 | 0.016 | 0.01 |
| 2.660928977590528 | 0.028 | 0.016 | 0.01 |
| 2.664070570244118 | 0.027 | 0.016 | 0.01 |
| 2.667212162897707 | 0.027 | 0.016 | 0.01 |
| 2.670353755551297 | 0.027 | 0.015 | 0.01 |
| 2.673495348204887 | 0.026 | 0.015 | 0.01 |
| 2.676636940858476 | 0.026 | 0.015 | 0.01 |
| 2.679778533512066 | 0.025 | 0.015 | 0.009 |
| 2.682920126165655 | 0.025 | 0.014 | 0.009 |
| 2.686061718819245 | 0.025 | 0.014 | 0.009 |
| 2.689203311472835 | 0.024 | 0.014 | 0.009 |
| 2.692344904126424 | 0.024 | 0.014 | 0.009 |
| 2.695486496780014 | 0.024 | 0.014 | 0.009 |
| 2.698628089433603 | 0.023 | 0.013 | 0.009 |
| 2.701769682087193 | 0.023 | 0.013 | 0.008 |
| 2.704911274740782 | 0.023 | 0.013 | 0.008 |
| 2.708052867394372 | 0.022 | 0.013 | 0.008 |
| 2.711194460047962 | 0.022 | 0.013 | 0.008 |
| 2.714336052701551 | 0.022 | 0.012 | 0.008 |
| 2.717477645355141 | 0.021 | 0.012 | 0.008 |
| 2.720619238008731 | 0.021 | 0.012 | 0.008 |
| 2.72376083066232 | 0.021 | 0.012 | 0.008 |
| 2.72690242331591 | 0.02 | 0.012 | 0.007 |
| 2.730044015969499 | 0.02 | 0.011 | 0.007 |
| 2.733185608623089 | 0.02 | 0.011 | 0.007 |
| 2.736327201276678 | 0.019 | 0.011 | 0.007 |
| 2.739468793930268 | 0.019 | 0.011 | 0.007 |
| 2.742610386583858 | 0.019 | 0.011 | 0.007 |
| 2.745751979237447 | 0.018 | 0.01 | 0.007 |
| 2.748893571891036 | 0.018 | 0.01 | 0.007 |
| 2.752035164544627 | 0.018 | 0.01 | 0.007 |
| 2.755176757198216 | 0.017 | 0.01 | 0.006 |
| 2.758318349851806 | 0.017 | 0.01 | 0.006 |
| 2.761459942505395 | 0.017 | 0.01 | 0.006 |
| 2.764601535158985 | 0.017 | 0.009 | 0.006 |
| 2.767743127812574 | 0.016 | 0.009 | 0.006 |
| 2.770884720466164 | 0.016 | 0.009 | 0.006 |
| 2.774026313119754 | 0.016 | 0.009 | 0.006 |
| 2.777167905773343 | 0.015 | 0.009 | 0.006 |
| 2.780309498426932 | 0.015 | 0.009 | 0.006 |
| 2.783451091080522 | 0.015 | 0.008 | 0.005 |
| 2.786592683734112 | 0.015 | 0.008 | 0.005 |
| 2.789734276387701 | 0.014 | 0.008 | 0.005 |
| 2.792875869041291 | 0.014 | 0.008 | 0.005 |
| 2.796017461694881 | 0.014 | 0.008 | 0.005 |
| 2.79915905434847 | 0.014 | 0.008 | 0.005 |
| 2.80230064700206 | 0.013 | 0.008 | 0.005 |
| 2.80544223965565 | 0.013 | 0.007 | 0.005 |
| 2.808583832309239 | 0.013 | 0.007 | 0.005 |
| 2.811725424962829 | 0.013 | 0.007 | 0.005 |
| 2.814867017616419 | 0.012 | 0.007 | 0.004 |
| 2.818008610270008 | 0.012 | 0.007 | 0.004 |
| 2.821150202923598 | 0.012 | 0.007 | 0.004 |
| 2.824291795577187 | 0.012 | 0.007 | 0.004 |
| 2.827433388230777 | 0.011 | 0.006 | 0.004 |
| 2.830574980884366 | 0.011 | 0.006 | 0.004 |
| 2.833716573537956 | 0.011 | 0.006 | 0.004 |
| 2.836858166191546 | 0.011 | 0.006 | 0.004 |
| 2.839999758845135 | 0.01 | 0.006 | 0.004 |
| 2.843141351498725 | 0.01 | 0.006 | 0.004 |
| 2.846282944152314 | 0.01 | 0.006 | 0.004 |
| 2.849424536805904 | 0.01 | 0.006 | 0.004 |
| 2.852566129459494 | 0.01 | 0.005 | 0.003 |
| 2.855707722113083 | 0.009 | 0.005 | 0.003 |
| 2.858849314766673 | 0.009 | 0.005 | 0.003 |
| 2.861990907420262 | 0.009 | 0.005 | 0.003 |
| 2.865132500073852 | 0.009 | 0.005 | 0.003 |
| 2.868274092727442 | 0.009 | 0.005 | 0.003 |
| 2.871415685381031 | 0.008 | 0.005 | 0.003 |
| 2.874557278034621 | 0.008 | 0.005 | 0.003 |
| 2.87769887068821 | 0.008 | 0.004 | 0.003 |
| 2.8808404633418 | 0.008 | 0.004 | 0.003 |
| 2.88398205599539 | 0.008 | 0.004 | 0.003 |
| 2.88712364864898 | 0.007 | 0.004 | 0.003 |
| 2.890265241302569 | 0.007 | 0.004 | 0.003 |
| 2.893406833956158 | 0.007 | 0.004 | 0.003 |
| 2.896548426609748 | 0.007 | 0.004 | 0.002 |
| 2.899690019263338 | 0.007 | 0.004 | 0.002 |
| 2.902831611916927 | 0.006 | 0.004 | 0.002 |
| 2.905973204570517 | 0.006 | 0.004 | 0.002 |
| 2.909114797224106 | 0.006 | 0.003 | 0.002 |
| 2.912256389877696 | 0.006 | 0.003 | 0.002 |
| 2.915397982531286 | 0.006 | 0.003 | 0.002 |
| 2.918539575184875 | 0.006 | 0.003 | 0.002 |
| 2.921681167838465 | 0.005 | 0.003 | 0.002 |
| 2.924822760492054 | 0.005 | 0.003 | 0.002 |
| 2.927964353145644 | 0.005 | 0.003 | 0.002 |
| 2.931105945799234 | 0.005 | 0.003 | 0.002 |
| 2.934247538452823 | 0.005 | 0.003 | 0.002 |
| 2.937389131106413 | 0.005 | 0.003 | 0.002 |
| 2.940530723760002 | 0.005 | 0.003 | 0.002 |
| 2.943672316413592 | 0.004 | 0.002 | 0.002 |
| 2.946813909067182 | 0.004 | 0.002 | 0.002 |
| 2.949955501720771 | 0.004 | 0.002 | 0.001 |
| 2.953097094374361 | 0.004 | 0.002 | 0.001 |
| 2.95623868702795 | 0.004 | 0.002 | 0.001 |
| 2.95938027968154 | 0.004 | 0.002 | 0.001 |
| 2.96252187233513 | 0.004 | 0.002 | 0.001 |
| 2.965663464988719 | 0.003 | 0.002 | 0.001 |
| 2.968805057642309 | 0.003 | 0.002 | 0.001 |
| 2.971946650295898 | 0.003 | 0.002 | 0.001 |
| 2.975088242949488 | 0.003 | 0.002 | 0.001 |
| 2.978229835603078 | 0.003 | 0.002 | 0.001 |
| 2.981371428256667 | 0.003 | 0.002 | 0.001 |
| 2.984513020910257 | 0.003 | 0.002 | 0.001 |
| 2.987654613563846 | 0.003 | 0.001 | 0.001 |
| 2.990796206217436 | 0.003 | 0.001 | 0.001 |
| 2.993937798871025 | 0.002 | 0.001 | 0.001 |
| 2.997079391524615 | 0.002 | 0.001 | 0.001 |
| 3.000220984178205 | 0.002 | 0.001 | 0.001 |
| 3.003362576831794 | 0.002 | 0.001 | 0.001 |
| 3.006504169485384 | 0.002 | 0.001 | 0.001 |
| 3.009645762138974 | 0.002 | 0.001 | 0.001 |
| 3.012787354792563 | 0.002 | 0.001 | 0.001 |
| 3.015928947446153 | 0.002 | 0.001 | 0.001 |
| 3.019070540099742 | 0.002 | 0.001 | 0.001 |
| 3.022212132753332 | 0.002 | 0.001 | 0.001 |
| 3.025353725406922 | 0.002 | 0.001 | 0.001 |
| 3.028495318060511 | 0.001 | 0.001 | 0.001 |
| 3.031636910714101 | 0.001 | 0.001 | 0 |
| 3.03477850336769 | 0.001 | 0.001 | 0 |
| 3.03792009602128 | 0.001 | 0.001 | 0 |
| 3.04106168867487 | 0.001 | 0.001 | 0 |
| 3.04420328132846 | 0.001 | 0.001 | 0 |
| 3.047344873982049 | 0.001 | 0.001 | 0 |
| 3.050486466635638 | 0.001 | 0.001 | 0 |
| 3.053628059289228 | 0.001 | 0 | 0 |
| 3.056769651942818 | 0.001 | 0 | 0 |
| 3.059911244596407 | 0.001 | 0 | 0 |
| 3.063052837249997 | 0.001 | 0 | 0 |
| 3.066194429903586 | 0.001 | 0 | 0 |
| 3.069336022557176 | 0.001 | 0 | 0 |
| 3.072477615210766 | 0.001 | 0 | 0 |
| 3.075619207864355 | 0 | 0 | 0 |
| 3.078760800517945 | 0 | 0 | 0 |
| 3.081902393171534 | 0 | 0 | 0 |
| 3.085043985825124 | 0 | 0 | 0 |
| 3.088185578478713 | 0 | 0 | 0 |
| 3.091327171132303 | 0 | 0 | 0 |
| 3.094468763785893 | 0 | 0 | 0 |
| 3.097610356439482 | 0 | 0 | 0 |
| 3.100751949093072 | 0 | 0 | 0 |
| 3.103893541746661 | 0 | 0 | 0 |
| 3.107035134400251 | 0 | 0 | 0 |
| 3.110176727053841 | 0 | 0 | 0 |
| 3.11331831970743 | 0 | 0 | 0 |
| 3.11645991236102 | 0 | 0 | 0 |
| 3.11960150501461 | 0 | 0 | 0 |
| 3.122743097668199 | 0 | 0 | 0 |
| 3.125884690321789 | 0 | 0 | 0 |
| 3.129026282975378 | 0 | 0 | 0 |
| 3.132167875628968 | 0 | 0 | 0 |
| 3.135309468282557 | 0 | 0 | 0 |
| 3.138451060936147 | 0 | 0 | 0 |
| 3.141592653589737 | 0 | 0 | 0 |
| 3.144734246243326 | 0 | 0 | 0 |
| 3.147875838896916 | 0 | 0 | 0 |
| 3.151017431550505 | 0 | 0 | 0 |
| 3.154159024204095 | 0 | 0 | 0 |
| 3.157300616857685 | 0 | 0 | 0 |
| 3.160442209511274 | 0 | 0 | 0 |
| 3.163583802164864 | 0 | 0 | 0 |
| 3.166725394818453 | 0 | 0 | 0 |
| 3.169866987472043 | 0 | 0 | 0 |
| 3.173008580125633 | 0 | 0 | 0 |
| 3.176150172779222 | 0 | 0 | 0 |
| 3.179291765432812 | 0 | 0 | 0 |
| 3.182433358086401 | 0 | 0 | 0 |
| 3.185574950739991 | 0 | 0 | 0 |
| 3.188716543393581 | 0 | 0 | 0 |
| 3.19185813604717 | 0 | 0 | 0 |
| 3.19499972870076 | 0 | 0 | 0 |
| 3.198141321354349 | 0 | 0 | 0 |
| 3.20128291400794 | 0 | 0 | 0 |
| 3.204424506661528 | 0 | 0 | 0 |
| 3.207566099315118 | 0 | 0 | 0 |
| 3.210707691968708 | 0.001 | 0 | 0 |
| 3.213849284622297 | 0.001 | 0 | 0 |
| 3.216990877275887 | 0.001 | 0 | 0 |
| 3.220132469929476 | 0.001 | 0 | 0 |
| 3.223274062583066 | 0.001 | 0 | 0 |
| 3.226415655236656 | 0.001 | 0 | 0 |
| 3.229557247890245 | 0.001 | 0 | 0 |
| 3.232698840543835 | 0.001 | 0.001 | 0 |
| 3.235840433197425 | 0.001 | 0.001 | 0 |
| 3.238982025851014 | 0.001 | 0.001 | 0 |
| 3.242123618504604 | 0.001 | 0.001 | 0 |
| 3.245265211158193 | 0.001 | 0.001 | 0 |
| 3.248406803811783 | 0.001 | 0.001 | 0 |
| 3.251548396465373 | 0.001 | 0.001 | 0 |
| 3.254689989118962 | 0.001 | 0.001 | 0.001 |
| 3.257831581772551 | 0.002 | 0.001 | 0.001 |
| 3.260973174426141 | 0.002 | 0.001 | 0.001 |
| 3.26411476707973 | 0.002 | 0.001 | 0.001 |
| 3.267256359733321 | 0.002 | 0.001 | 0.001 |
| 3.27039795238691 | 0.002 | 0.001 | 0.001 |
| 3.2735395450405 | 0.002 | 0.001 | 0.001 |
| 3.276681137694089 | 0.002 | 0.001 | 0.001 |
| 3.279822730347679 | 0.002 | 0.001 | 0.001 |
| 3.282964323001269 | 0.002 | 0.001 | 0.001 |
| 3.286105915654858 | 0.002 | 0.001 | 0.001 |
| 3.289247508308448 | 0.002 | 0.001 | 0.001 |
| 3.292389100962037 | 0.003 | 0.001 | 0.001 |
| 3.295530693615627 | 0.003 | 0.001 | 0.001 |
| 3.298672286269217 | 0.003 | 0.002 | 0.001 |
| 3.301813878922806 | 0.003 | 0.002 | 0.001 |
| 3.304955471576396 | 0.003 | 0.002 | 0.001 |
| 3.308097064229985 | 0.003 | 0.002 | 0.001 |
| 3.311238656883575 | 0.003 | 0.002 | 0.001 |
| 3.314380249537165 | 0.003 | 0.002 | 0.001 |
| 3.317521842190754 | 0.003 | 0.002 | 0.001 |
| 3.320663434844344 | 0.004 | 0.002 | 0.001 |
| 3.323805027497933 | 0.004 | 0.002 | 0.001 |
| 3.326946620151523 | 0.004 | 0.002 | 0.001 |
| 3.330088212805113 | 0.004 | 0.002 | 0.001 |
| 3.333229805458702 | 0.004 | 0.002 | 0.001 |
| 3.336371398112292 | 0.004 | 0.002 | 0.002 |
| 3.339512990765881 | 0.004 | 0.002 | 0.002 |
| 3.342654583419471 | 0.005 | 0.003 | 0.002 |
| 3.345796176073061 | 0.005 | 0.003 | 0.002 |
| 3.34893776872665 | 0.005 | 0.003 | 0.002 |
| 3.35207936138024 | 0.005 | 0.003 | 0.002 |
| 3.355220954033829 | 0.005 | 0.003 | 0.002 |
| 3.358362546687419 | 0.005 | 0.003 | 0.002 |
| 3.361504139341009 | 0.005 | 0.003 | 0.002 |
| 3.364645731994598 | 0.006 | 0.003 | 0.002 |
| 3.367787324648188 | 0.006 | 0.003 | 0.002 |
| 3.370928917301777 | 0.006 | 0.003 | 0.002 |
| 3.374070509955367 | 0.006 | 0.003 | 0.002 |
| 3.377212102608956 | 0.006 | 0.004 | 0.002 |
| 3.380353695262546 | 0.006 | 0.004 | 0.002 |
| 3.383495287916136 | 0.007 | 0.004 | 0.002 |
| 3.386636880569725 | 0.007 | 0.004 | 0.002 |
| 3.389778473223315 | 0.007 | 0.004 | 0.003 |
| 3.392920065876904 | 0.007 | 0.004 | 0.003 |
| 3.396061658530494 | 0.007 | 0.004 | 0.003 |
| 3.399203251184084 | 0.008 | 0.004 | 0.003 |
| 3.402344843837673 | 0.008 | 0.004 | 0.003 |
| 3.405486436491263 | 0.008 | 0.004 | 0.003 |
| 3.408628029144852 | 0.008 | 0.005 | 0.003 |
| 3.411769621798442 | 0.008 | 0.005 | 0.003 |
| 3.414911214452032 | 0.009 | 0.005 | 0.003 |
| 3.418052807105621 | 0.009 | 0.005 | 0.003 |
| 3.421194399759211 | 0.009 | 0.005 | 0.003 |
| 3.4243359924128 | 0.009 | 0.005 | 0.003 |
| 3.42747758506639 | 0.009 | 0.005 | 0.003 |
| 3.43061917771998 | 0.01 | 0.005 | 0.003 |
| 3.433760770373569 | 0.01 | 0.006 | 0.004 |
| 3.436902363027159 | 0.01 | 0.006 | 0.004 |
| 3.440043955680748 | 0.01 | 0.006 | 0.004 |
| 3.443185548334338 | 0.01 | 0.006 | 0.004 |
| 3.446327140987927 | 0.011 | 0.006 | 0.004 |
| 3.449468733641517 | 0.011 | 0.006 | 0.004 |
| 3.452610326295107 | 0.011 | 0.006 | 0.004 |
| 3.455751918948696 | 0.011 | 0.006 | 0.004 |
| 3.458893511602286 | 0.012 | 0.007 | 0.004 |
| 3.462035104255876 | 0.012 | 0.007 | 0.004 |
| 3.465176696909465 | 0.012 | 0.007 | 0.004 |
| 3.468318289563055 | 0.012 | 0.007 | 0.004 |
| 3.471459882216644 | 0.013 | 0.007 | 0.005 |
| 3.474601474870234 | 0.013 | 0.007 | 0.005 |
| 3.477743067523824 | 0.013 | 0.007 | 0.005 |
| 3.480884660177413 | 0.013 | 0.008 | 0.005 |
| 3.484026252831002 | 0.014 | 0.008 | 0.005 |
| 3.487167845484592 | 0.014 | 0.008 | 0.005 |
| 3.490309438138182 | 0.014 | 0.008 | 0.005 |
| 3.493451030791772 | 0.014 | 0.008 | 0.005 |
| 3.496592623445361 | 0.015 | 0.008 | 0.005 |
| 3.499734216098951 | 0.015 | 0.008 | 0.005 |
| 3.50287580875254 | 0.015 | 0.009 | 0.006 |
| 3.50601740140613 | 0.015 | 0.009 | 0.006 |
| 3.50915899405972 | 0.016 | 0.009 | 0.006 |
| 3.512300586713309 | 0.016 | 0.009 | 0.006 |
| 3.515442179366899 | 0.016 | 0.009 | 0.006 |
| 3.518583772020488 | 0.017 | 0.009 | 0.006 |
| 3.521725364674078 | 0.017 | 0.01 | 0.006 |
| 3.524866957327668 | 0.017 | 0.01 | 0.006 |
| 3.528008549981257 | 0.017 | 0.01 | 0.006 |
| 3.531150142634847 | 0.018 | 0.01 | 0.007 |
| 3.534291735288436 | 0.018 | 0.01 | 0.007 |
| 3.537433327942026 | 0.018 | 0.01 | 0.007 |
| 3.540574920595616 | 0.019 | 0.011 | 0.007 |
| 3.543716513249205 | 0.019 | 0.011 | 0.007 |
| 3.546858105902795 | 0.019 | 0.011 | 0.007 |
| 3.549999698556384 | 0.02 | 0.011 | 0.007 |
| 3.553141291209974 | 0.02 | 0.011 | 0.007 |
| 3.556282883863564 | 0.02 | 0.012 | 0.007 |
| 3.559424476517153 | 0.021 | 0.012 | 0.008 |
| 3.562566069170743 | 0.021 | 0.012 | 0.008 |
| 3.565707661824332 | 0.021 | 0.012 | 0.008 |
| 3.568849254477922 | 0.022 | 0.012 | 0.008 |
| 3.571990847131511 | 0.022 | 0.013 | 0.008 |
| 3.575132439785101 | 0.022 | 0.013 | 0.008 |
| 3.578274032438691 | 0.023 | 0.013 | 0.008 |
| 3.58141562509228 | 0.023 | 0.013 | 0.008 |
| 3.58455721774587 | 0.023 | 0.013 | 0.009 |
| 3.58769881039946 | 0.024 | 0.014 | 0.009 |
| 3.590840403053049 | 0.024 | 0.014 | 0.009 |
| 3.593981995706639 | 0.024 | 0.014 | 0.009 |
| 3.597123588360228 | 0.025 | 0.014 | 0.009 |
| 3.600265181013818 | 0.025 | 0.014 | 0.009 |
| 3.603406773667407 | 0.025 | 0.015 | 0.009 |
| 3.606548366320997 | 0.026 | 0.015 | 0.01 |
| 3.609689958974587 | 0.026 | 0.015 | 0.01 |
| 3.612831551628176 | 0.027 | 0.015 | 0.01 |
| 3.615973144281766 | 0.027 | 0.016 | 0.01 |
| 3.619114736935355 | 0.027 | 0.016 | 0.01 |
| 3.622256329588945 | 0.028 | 0.016 | 0.01 |
| 3.625397922242534 | 0.028 | 0.016 | 0.01 |
| 3.628539514896124 | 0.029 | 0.016 | 0.011 |
| 3.631681107549714 | 0.029 | 0.017 | 0.011 |
| 3.634822700203303 | 0.029 | 0.017 | 0.011 |
| 3.637964292856893 | 0.03 | 0.017 | 0.011 |
| 3.641105885510483 | 0.03 | 0.017 | 0.011 |
| 3.644247478164072 | 0.031 | 0.018 | 0.011 |
| 3.647389070817662 | 0.031 | 0.018 | 0.012 |
| 3.650530663471251 | 0.031 | 0.018 | 0.012 |
| 3.653672256124841 | 0.032 | 0.018 | 0.012 |
| 3.656813848778431 | 0.032 | 0.019 | 0.012 |
| 3.65995544143202 | 0.033 | 0.019 | 0.012 |
| 3.66309703408561 | 0.033 | 0.019 | 0.012 |
| 3.666238626739199 | 0.034 | 0.019 | 0.013 |
| 3.66938021939279 | 0.034 | 0.02 | 0.013 |
| 3.672521812046378 | 0.035 | 0.02 | 0.013 |
| 3.675663404699968 | 0.035 | 0.02 | 0.013 |
| 3.678804997353558 | 0.035 | 0.02 | 0.013 |
| 3.681946590007147 | 0.036 | 0.021 | 0.013 |
| 3.685088182660737 | 0.036 | 0.021 | 0.014 |
| 3.688229775314326 | 0.037 | 0.021 | 0.014 |
| 3.691371367967916 | 0.037 | 0.022 | 0.014 |
| 3.694512960621506 | 0.038 | 0.022 | 0.014 |
| 3.697654553275095 | 0.038 | 0.022 | 0.014 |
| 3.700796145928685 | 0.039 | 0.022 | 0.015 |
| 3.703937738582274 | 0.039 | 0.023 | 0.015 |
| 3.707079331235864 | 0.04 | 0.023 | 0.015 |
| 3.710220923889454 | 0.04 | 0.023 | 0.015 |
| 3.713362516543043 | 0.041 | 0.024 | 0.015 |
| 3.716504109196633 | 0.041 | 0.024 | 0.016 |
| 3.719645701850223 | 0.042 | 0.024 | 0.016 |
| 3.722787294503812 | 0.042 | 0.025 | 0.016 |
| 3.725928887157402 | 0.043 | 0.025 | 0.016 |
| 3.729070479810991 | 0.043 | 0.025 | 0.016 |
| 3.732212072464581 | 0.044 | 0.025 | 0.017 |
| 3.735353665118171 | 0.044 | 0.026 | 0.017 |
| 3.73849525777176 | 0.045 | 0.026 | 0.017 |
| 3.74163685042535 | 0.045 | 0.026 | 0.017 |
| 3.744778443078939 | 0.046 | 0.027 | 0.017 |
| 3.747920035732529 | 0.046 | 0.027 | 0.018 |
| 3.751061628386119 | 0.047 | 0.027 | 0.018 |
| 3.754203221039708 | 0.048 | 0.028 | 0.018 |
| 3.757344813693298 | 0.048 | 0.028 | 0.018 |
| 3.760486406346887 | 0.049 | 0.028 | 0.019 |
| 3.763627999000477 | 0.049 | 0.029 | 0.019 |
| 3.766769591654067 | 0.05 | 0.029 | 0.019 |
| 3.769911184307656 | 0.05 | 0.029 | 0.019 |
| 3.773052776961246 | 0.051 | 0.03 | 0.019 |
| 3.776194369614835 | 0.052 | 0.03 | 0.02 |
| 3.779335962268425 | 0.052 | 0.03 | 0.02 |
| 3.782477554922014 | 0.053 | 0.031 | 0.02 |
| 3.785619147575604 | 0.053 | 0.031 | 0.02 |
| 3.788760740229193 | 0.054 | 0.032 | 0.021 |
| 3.791902332882783 | 0.055 | 0.032 | 0.021 |
| 3.795043925536373 | 0.055 | 0.032 | 0.021 |
| 3.798185518189962 | 0.056 | 0.033 | 0.021 |
| 3.801327110843552 | 0.056 | 0.033 | 0.022 |
| 3.804468703497142 | 0.057 | 0.033 | 0.022 |
| 3.807610296150731 | 0.058 | 0.034 | 0.022 |
| 3.810751888804321 | 0.058 | 0.034 | 0.022 |
| 3.813893481457911 | 0.059 | 0.035 | 0.023 |
| 3.8170350741115 | 0.06 | 0.035 | 0.023 |
| 3.82017666676509 | 0.06 | 0.035 | 0.023 |
| 3.823318259418679 | 0.061 | 0.036 | 0.024 |
| 3.826459852072269 | 0.062 | 0.036 | 0.024 |
| 3.829601444725859 | 0.062 | 0.037 | 0.024 |
| 3.832743037379448 | 0.063 | 0.037 | 0.024 |
| 3.835884630033038 | 0.064 | 0.037 | 0.025 |
| 3.839026222686627 | 0.064 | 0.038 | 0.025 |
| 3.842167815340217 | 0.065 | 0.038 | 0.025 |
| 3.845309407993807 | 0.066 | 0.039 | 0.026 |
| 3.848451000647396 | 0.066 | 0.039 | 0.026 |
| 3.851592593300986 | 0.067 | 0.04 | 0.026 |
| 3.854734185954575 | 0.068 | 0.04 | 0.026 |
| 3.857875778608165 | 0.069 | 0.04 | 0.027 |
| 3.861017371261755 | 0.069 | 0.041 | 0.027 |
| 3.864158963915344 | 0.07 | 0.041 | 0.027 |
| 3.867300556568933 | 0.071 | 0.042 | 0.028 |
| 3.870442149222523 | 0.071 | 0.042 | 0.028 |
| 3.873583741876112 | 0.072 | 0.043 | 0.028 |
| 3.876725334529703 | 0.073 | 0.043 | 0.029 |
| 3.879866927183292 | 0.074 | 0.044 | 0.029 |
| 3.883008519836882 | 0.074 | 0.044 | 0.029 |
| 3.886150112490471 | 0.075 | 0.045 | 0.03 |
| 3.889291705144061 | 0.076 | 0.045 | 0.03 |
| 3.892433297797651 | 0.077 | 0.046 | 0.03 |
| 3.89557489045124 | 0.078 | 0.046 | 0.031 |
| 3.89871648310483 | 0.078 | 0.047 | 0.031 |
| 3.901858075758419 | 0.079 | 0.047 | 0.031 |
| 3.904999668412009 | 0.08 | 0.048 | 0.032 |
| 3.908141261065598 | 0.081 | 0.048 | 0.032 |
| 3.911282853719188 | 0.082 | 0.049 | 0.032 |
| 3.914424446372778 | 0.082 | 0.049 | 0.033 |
| 3.917566039026367 | 0.083 | 0.05 | 0.033 |
| 3.920707631679957 | 0.084 | 0.05 | 0.033 |
| 3.923849224333547 | 0.085 | 0.051 | 0.034 |
| 3.926990816987136 | 0.086 | 0.051 | 0.034 |
| 3.930132409640726 | 0.087 | 0.052 | 0.034 |
| 3.933274002294315 | 0.088 | 0.052 | 0.035 |
| 3.936415594947905 | 0.088 | 0.053 | 0.035 |
| 3.939557187601495 | 0.089 | 0.054 | 0.036 |
| 3.942698780255084 | 0.09 | 0.054 | 0.036 |
| 3.945840372908674 | 0.091 | 0.055 | 0.036 |
| 3.948981965562263 | 0.092 | 0.055 | 0.037 |
| 3.952123558215853 | 0.093 | 0.056 | 0.037 |
| 3.955265150869442 | 0.094 | 0.056 | 0.038 |
| 3.958406743523032 | 0.095 | 0.057 | 0.038 |
| 3.961548336176622 | 0.096 | 0.058 | 0.038 |
| 3.964689928830211 | 0.097 | 0.058 | 0.039 |
| 3.967831521483801 | 0.097 | 0.059 | 0.039 |
| 3.97097311413739 | 0.098 | 0.059 | 0.04 |
| 3.97411470679098 | 0.099 | 0.06 | 0.04 |
| 3.97725629944457 | 0.1 | 0.061 | 0.041 |
| 3.98039789209816 | 0.101 | 0.061 | 0.041 |
| 3.983539484751749 | 0.102 | 0.062 | 0.041 |
| 3.986681077405338 | 0.103 | 0.063 | 0.042 |
| 3.989822670058928 | 0.104 | 0.063 | 0.042 |
| 3.992964262712517 | 0.105 | 0.064 | 0.043 |
| 3.996105855366107 | 0.106 | 0.065 | 0.043 |
| 3.999247448019697 | 0.107 | 0.065 | 0.044 |
| 4.002389040673287 | 0.108 | 0.066 | 0.044 |
| 4.005530633326877 | 0.109 | 0.067 | 0.045 |
| 4.008672225980466 | 0.11 | 0.067 | 0.045 |
| 4.011813818634056 | 0.112 | 0.068 | 0.046 |
| 4.014955411287645 | 0.113 | 0.069 | 0.046 |
| 4.018097003941234 | 0.114 | 0.069 | 0.047 |
| 4.021238596594824 | 0.115 | 0.07 | 0.047 |
| 4.024380189248414 | 0.116 | 0.071 | 0.048 |
| 4.027521781902004 | 0.117 | 0.071 | 0.048 |
| 4.030663374555593 | 0.118 | 0.072 | 0.049 |
| 4.033804967209183 | 0.119 | 0.073 | 0.049 |
| 4.036946559862773 | 0.12 | 0.074 | 0.05 |
| 4.040088152516362 | 0.121 | 0.074 | 0.05 |
| 4.043229745169951 | 0.123 | 0.075 | 0.051 |
| 4.046371337823541 | 0.124 | 0.076 | 0.051 |
| 4.049512930477131 | 0.125 | 0.077 | 0.052 |
| 4.05265452313072 | 0.126 | 0.077 | 0.052 |
| 4.05579611578431 | 0.127 | 0.078 | 0.053 |
| 4.0589377084379 | 0.128 | 0.079 | 0.054 |
| 4.062079301091489 | 0.13 | 0.08 | 0.054 |
| 4.065220893745079 | 0.131 | 0.081 | 0.055 |
| 4.068362486398668 | 0.132 | 0.081 | 0.055 |
| 4.071504079052258 | 0.133 | 0.082 | 0.056 |
| 4.074645671705848 | 0.134 | 0.083 | 0.056 |
| 4.077787264359437 | 0.136 | 0.084 | 0.057 |
| 4.080928857013027 | 0.137 | 0.085 | 0.058 |
| 4.084070449666616 | 0.138 | 0.086 | 0.058 |
| 4.087212042320206 | 0.14 | 0.087 | 0.059 |
| 4.090353634973795 | 0.141 | 0.087 | 0.06 |
| 4.093495227627385 | 0.142 | 0.088 | 0.06 |
| 4.096636820280975 | 0.143 | 0.089 | 0.061 |
| 4.099778412934564 | 0.145 | 0.09 | 0.061 |
| 4.102920005588154 | 0.146 | 0.091 | 0.062 |
| 4.106061598241744 | 0.147 | 0.092 | 0.063 |
| 4.109203190895333 | 0.149 | 0.093 | 0.063 |
| 4.112344783548923 | 0.15 | 0.094 | 0.064 |
| 4.115486376202512 | 0.152 | 0.095 | 0.065 |
| 4.118627968856102 | 0.153 | 0.096 | 0.066 |
| 4.121769561509692 | 0.154 | 0.097 | 0.066 |
| 4.124911154163281 | 0.156 | 0.098 | 0.067 |
| 4.128052746816871 | 0.157 | 0.099 | 0.068 |
| 4.13119433947046 | 0.159 | 0.1 | 0.068 |
| 4.13433593212405 | 0.16 | 0.101 | 0.069 |
| 4.13747752477764 | 0.162 | 0.102 | 0.07 |
| 4.14061911743123 | 0.163 | 0.103 | 0.071 |
| 4.143760710084818 | 0.165 | 0.104 | 0.071 |
| 4.146902302738408 | 0.166 | 0.105 | 0.072 |
| 4.150043895391998 | 0.168 | 0.106 | 0.073 |
| 4.153185488045588 | 0.169 | 0.107 | 0.074 |
| 4.156327080699177 | 0.171 | 0.108 | 0.075 |
| 4.159468673352766 | 0.172 | 0.109 | 0.075 |
| 4.162610266006356 | 0.174 | 0.11 | 0.076 |
| 4.165751858659946 | 0.175 | 0.111 | 0.077 |
| 4.168893451313535 | 0.177 | 0.113 | 0.078 |
| 4.172035043967125 | 0.179 | 0.114 | 0.079 |
| 4.175176636620715 | 0.18 | 0.115 | 0.08 |
| 4.178318229274304 | 0.182 | 0.116 | 0.08 |
| 4.181459821927894 | 0.184 | 0.117 | 0.081 |
| 4.184601414581484 | 0.185 | 0.118 | 0.082 |
| 4.187743007235073 | 0.187 | 0.12 | 0.083 |
| 4.190884599888663 | 0.189 | 0.121 | 0.084 |
| 4.194026192542252 | 0.19 | 0.122 | 0.085 |
| 4.197167785195842 | 0.192 | 0.123 | 0.086 |
| 4.200309377849432 | 0.194 | 0.125 | 0.087 |
| 4.203450970503021 | 0.196 | 0.126 | 0.088 |
| 4.206592563156611 | 0.197 | 0.127 | 0.089 |
| 4.2097341558102 | 0.199 | 0.128 | 0.09 |
| 4.21287574846379 | 0.201 | 0.13 | 0.091 |
| 4.21601734111738 | 0.203 | 0.131 | 0.092 |
| 4.21915893377097 | 0.205 | 0.132 | 0.093 |
| 4.222300526424559 | 0.207 | 0.134 | 0.094 |
| 4.225442119078148 | 0.208 | 0.135 | 0.095 |
| 4.228583711731738 | 0.21 | 0.137 | 0.096 |
| 4.231725304385327 | 0.212 | 0.138 | 0.097 |
| 4.234866897038917 | 0.214 | 0.139 | 0.098 |
| 4.238008489692506 | 0.216 | 0.141 | 0.099 |
| 4.241150082346096 | 0.218 | 0.142 | 0.1 |
| 4.244291674999685 | 0.22 | 0.144 | 0.101 |
| 4.247433267653276 | 0.222 | 0.145 | 0.102 |
| 4.250574860306865 | 0.224 | 0.147 | 0.104 |
| 4.253716452960455 | 0.226 | 0.148 | 0.105 |
| 4.256858045614044 | 0.228 | 0.15 | 0.106 |
| 4.259999638267634 | 0.23 | 0.151 | 0.107 |
| 4.263141230921224 | 0.232 | 0.153 | 0.108 |
| 4.266282823574813 | 0.235 | 0.155 | 0.11 |
| 4.269424416228403 | 0.237 | 0.156 | 0.111 |
| 4.272566008881992 | 0.239 | 0.158 | 0.112 |
| 4.275707601535582 | 0.241 | 0.16 | 0.113 |
| 4.27884919418917 | 0.243 | 0.161 | 0.115 |
| 4.28199078684276 | 0.245 | 0.163 | 0.116 |
| 4.285132379496351 | 0.248 | 0.165 | 0.117 |
| 4.28827397214994 | 0.25 | 0.166 | 0.119 |
| 4.29141556480353 | 0.252 | 0.168 | 0.12 |
| 4.294557157457119 | 0.255 | 0.17 | 0.121 |
| 4.29769875011071 | 0.257 | 0.172 | 0.123 |
| 4.300840342764299 | 0.259 | 0.174 | 0.124 |
| 4.303981935417888 | 0.262 | 0.175 | 0.126 |
| 4.307123528071478 | 0.264 | 0.177 | 0.127 |
| 4.310265120725067 | 0.266 | 0.179 | 0.129 |
| 4.313406713378657 | 0.269 | 0.181 | 0.13 |
| 4.316548306032247 | 0.271 | 0.183 | 0.132 |
| 4.319689898685836 | 0.274 | 0.185 | 0.133 |
| 4.322831491339426 | 0.276 | 0.187 | 0.135 |
| 4.325973083993015 | 0.279 | 0.189 | 0.136 |
| 4.329114676646605 | 0.282 | 0.191 | 0.138 |
| 4.332256269300195 | 0.284 | 0.193 | 0.14 |
| 4.335397861953784 | 0.287 | 0.195 | 0.141 |
| 4.338539454607374 | 0.289 | 0.197 | 0.143 |
| 4.341681047260963 | 0.292 | 0.199 | 0.145 |
| 4.344822639914553 | 0.295 | 0.202 | 0.147 |
| 4.347964232568143 | 0.298 | 0.204 | 0.148 |
| 4.351105825221732 | 0.3 | 0.206 | 0.15 |
| 4.354247417875322 | 0.303 | 0.208 | 0.152 |
| 4.357389010528911 | 0.306 | 0.211 | 0.154 |
| 4.360530603182501 | 0.309 | 0.213 | 0.156 |
| 4.36367219583609 | 0.312 | 0.215 | 0.158 |
| 4.36681378848968 | 0.315 | 0.218 | 0.16 |
| 4.36995538114327 | 0.318 | 0.22 | 0.162 |
| 4.373096973796859 | 0.321 | 0.223 | 0.164 |
| 4.376238566450449 | 0.324 | 0.225 | 0.166 |
| 4.379380159104038 | 0.327 | 0.228 | 0.168 |
| 4.382521751757628 | 0.33 | 0.23 | 0.17 |
| 4.385663344411217 | 0.333 | 0.233 | 0.172 |
| 4.388804937064807 | 0.336 | 0.235 | 0.174 |
| 4.391946529718397 | 0.339 | 0.238 | 0.176 |
| 4.395088122371987 | 0.342 | 0.241 | 0.179 |
| 4.398229715025576 | 0.345 | 0.244 | 0.181 |
| 4.401371307679165 | 0.349 | 0.246 | 0.183 |
| 4.404512900332755 | 0.352 | 0.249 | 0.186 |
| 4.407654492986345 | 0.355 | 0.252 | 0.188 |
| 4.410796085639934 | 0.359 | 0.255 | 0.19 |
| 4.413937678293524 | 0.362 | 0.258 | 0.193 |
| 4.417079270947114 | 0.366 | 0.261 | 0.195 |
| 4.420220863600703 | 0.369 | 0.264 | 0.198 |
| 4.423362456254293 | 0.373 | 0.267 | 0.201 |
| 4.426504048907883 | 0.376 | 0.27 | 0.203 |
| 4.429645641561472 | 0.38 | 0.273 | 0.206 |
| 4.432787234215062 | 0.384 | 0.276 | 0.209 |
| 4.435928826868651 | 0.387 | 0.28 | 0.212 |
| 4.43907041952224 | 0.391 | 0.283 | 0.214 |
| 4.44221201217583 | 0.395 | 0.286 | 0.217 |
| 4.44535360482942 | 0.399 | 0.29 | 0.22 |
| 4.44849519748301 | 0.402 | 0.293 | 0.223 |
| 4.4516367901366 | 0.406 | 0.297 | 0.226 |
| 4.454778382790188 | 0.41 | 0.3 | 0.229 |
| 4.457919975443779 | 0.414 | 0.304 | 0.233 |
| 4.461061568097368 | 0.418 | 0.308 | 0.236 |
| 4.464203160750958 | 0.423 | 0.311 | 0.239 |
| 4.467344753404547 | 0.427 | 0.315 | 0.242 |
| 4.470486346058137 | 0.431 | 0.319 | 0.246 |
| 4.473627938711726 | 0.435 | 0.323 | 0.249 |
| 4.476769531365316 | 0.439 | 0.327 | 0.253 |
| 4.479911124018905 | 0.444 | 0.331 | 0.256 |
| 4.483052716672495 | 0.448 | 0.335 | 0.26 |
| 4.486194309326085 | 0.453 | 0.339 | 0.264 |
| 4.489335901979674 | 0.457 | 0.344 | 0.268 |
| 4.492477494633264 | 0.462 | 0.348 | 0.272 |
| 4.495619087286854 | 0.466 | 0.352 | 0.276 |
| 4.498760679940443 | 0.471 | 0.357 | 0.28 |
| 4.501902272594033 | 0.476 | 0.361 | 0.284 |
| 4.505043865247622 | 0.48 | 0.366 | 0.288 |
| 4.508185457901212 | 0.485 | 0.371 | 0.292 |
| 4.511327050554801 | 0.49 | 0.375 | 0.297 |
| 4.514468643208391 | 0.495 | 0.38 | 0.301 |
| 4.517610235861981 | 0.5 | 0.385 | 0.306 |
| 4.520751828515571 | 0.505 | 0.39 | 0.31 |
| 4.52389342116916 | 0.511 | 0.395 | 0.315 |
| 4.52703501382275 | 0.516 | 0.401 | 0.32 |
| 4.530176606476339 | 0.521 | 0.406 | 0.325 |
| 4.533318199129928 | 0.526 | 0.411 | 0.33 |
| 4.536459791783518 | 0.532 | 0.417 | 0.335 |
| 4.539601384437108 | 0.537 | 0.422 | 0.341 |
| 4.542742977090698 | 0.543 | 0.428 | 0.346 |
| 4.545884569744287 | 0.549 | 0.434 | 0.352 |
| 4.549026162397876 | 0.554 | 0.44 | 0.357 |
| 4.552167755051466 | 0.56 | 0.446 | 0.363 |
| 4.555309347705056 | 0.566 | 0.452 | 0.369 |
| 4.558450940358646 | 0.572 | 0.458 | 0.375 |
| 4.561592533012235 | 0.578 | 0.464 | 0.381 |
| 4.564734125665825 | 0.584 | 0.471 | 0.388 |
| 4.567875718319415 | 0.59 | 0.478 | 0.394 |
| 4.571017310973004 | 0.597 | 0.484 | 0.401 |
| 4.574158903626594 | 0.603 | 0.491 | 0.408 |
| 4.577300496280183 | 0.609 | 0.498 | 0.415 |
| 4.580442088933772 | 0.616 | 0.505 | 0.422 |
| 4.583583681587362 | 0.623 | 0.512 | 0.429 |
| 4.586725274240952 | 0.629 | 0.52 | 0.437 |
| 4.589866866894542 | 0.636 | 0.527 | 0.444 |
| 4.593008459548131 | 0.643 | 0.535 | 0.452 |
| 4.596150052201721 | 0.65 | 0.543 | 0.46 |
| 4.59929164485531 | 0.657 | 0.551 | 0.469 |
| 4.6024332375089 | 0.664 | 0.559 | 0.477 |
| 4.60557483016249 | 0.672 | 0.568 | 0.486 |
| 4.608716422816079 | 0.679 | 0.576 | 0.495 |
| 4.611858015469668 | 0.687 | 0.585 | 0.504 |
| 4.614999608123258 | 0.694 | 0.594 | 0.513 |
| 4.618141200776848 | 0.702 | 0.603 | 0.523 |
| 4.621282793430437 | 0.71 | 0.612 | 0.533 |
| 4.624424386084027 | 0.718 | 0.622 | 0.543 |
| 4.627565978737617 | 0.726 | 0.631 | 0.554 |
| 4.630707571391206 | 0.734 | 0.641 | 0.565 |
| 4.633849164044795 | 0.743 | 0.651 | 0.576 |
| 4.636990756698386 | 0.751 | 0.662 | 0.587 |
| 4.640132349351975 | 0.76 | 0.672 | 0.599 |
| 4.643273942005564 | 0.768 | 0.683 | 0.611 |
| 4.646415534659154 | 0.777 | 0.694 | 0.623 |
| 4.649557127312744 | 0.786 | 0.705 | 0.636 |
| 4.652698719966334 | 0.795 | 0.717 | 0.649 |
| 4.655840312619923 | 0.805 | 0.729 | 0.663 |
| 4.658981905273513 | 0.814 | 0.741 | 0.677 |
| 4.662123497927102 | 0.824 | 0.753 | 0.692 |
| 4.665265090580692 | 0.833 | 0.766 | 0.706 |
| 4.668406683234282 | 0.843 | 0.779 | 0.722 |
| 4.671548275887871 | 0.853 | 0.792 | 0.738 |
| 4.674689868541461 | 0.863 | 0.806 | 0.754 |
| 4.67783146119505 | 0.874 | 0.82 | 0.771 |
| 4.68097305384864 | 0.884 | 0.834 | 0.788 |
| 4.68411464650223 | 0.895 | 0.849 | 0.806 |
| 4.687256239155819 | 0.906 | 0.864 | 0.825 |
| 4.690397831809409 | 0.917 | 0.88 | 0.844 |
| 4.693539424462998 | 0.928 | 0.896 | 0.864 |
| 4.696681017116588 | 0.94 | 0.912 | 0.885 |
| 4.699822609770177 | 0.951 | 0.929 | 0.906 |
| 4.702964202423767 | 0.963 | 0.946 | 0.929 |
| 4.706105795077356 | 0.975 | 0.963 | 0.952 |
| 4.709247387730946 | 0.988 | 0.981 | 0.975 |
| 4.712388980384535 | 1 | 1 | 1 |
| 4.715530573038126 | 1.013 | 1.019 | 1.026 |
| 4.718672165691715 | 1.026 | 1.039 | 1.052 |
| 4.721813758345305 | 1.039 | 1.059 | 1.08 |
| 4.724955350998894 | 1.052 | 1.08 | 1.108 |
| 4.728096943652484 | 1.066 | 1.101 | 1.138 |
| 4.731238536306074 | 1.079 | 1.123 | 1.169 |
| 4.734380128959663 | 1.094 | 1.146 | 1.202 |
| 4.737521721613253 | 1.108 | 1.169 | 1.235 |
| 4.740663314266842 | 1.123 | 1.193 | 1.27 |
| 4.743804906920432 | 1.137 | 1.218 | 1.307 |
| 4.74694649957402 | 1.153 | 1.243 | 1.345 |
| 4.750088092227611 | 1.168 | 1.269 | 1.385 |
| 4.7532296848812 | 1.184 | 1.296 | 1.426 |
| 4.75637127753479 | 1.2 | 1.324 | 1.47 |
| 4.75951287018838 | 1.216 | 1.353 | 1.515 |
| 4.76265446284197 | 1.233 | 1.383 | 1.562 |
| 4.765796055495559 | 1.25 | 1.414 | 1.612 |
| 4.768937648149149 | 1.267 | 1.445 | 1.664 |
| 4.772079240802738 | 1.285 | 1.478 | 1.719 |
| 4.775220833456327 | 1.303 | 1.512 | 1.776 |
| 4.778362426109917 | 1.321 | 1.547 | 1.837 |
| 4.781504018763507 | 1.34 | 1.583 | 1.9 |
| 4.784645611417097 | 1.359 | 1.621 | 1.967 |
| 4.787787204070686 | 1.378 | 1.66 | 2.037 |
| 4.790928796724275 | 1.398 | 1.7 | 2.111 |
| 4.794070389377865 | 1.419 | 1.742 | 2.189 |
| 4.797211982031455 | 1.439 | 1.785 | 2.272 |
| 4.800353574685045 | 1.46 | 1.83 | 2.359 |
| 4.803495167338634 | 1.482 | 1.876 | 2.451 |
| 4.806636759992224 | 1.504 | 1.924 | 2.549 |
| 4.809778352645814 | 1.527 | 1.974 | 2.653 |
| 4.812919945299403 | 1.55 | 2.027 | 2.763 |
| 4.816061537952993 | 1.573 | 2.081 | 2.88 |
| 4.819203130606582 | 1.597 | 2.137 | 3.005 |
| 4.822344723260172 | 1.622 | 2.196 | 3.138 |
| 4.825486315913761 | 1.647 | 2.257 | 3.281 |
| 4.828627908567351 | 1.672 | 2.32 | 3.433 |
| 4.83176950122094 | 1.699 | 2.387 | 3.596 |
| 4.83491109387453 | 1.726 | 2.456 | 3.77 |
| 4.83805268652812 | 1.753 | 2.528 | 3.958 |
| 4.841194279181709 | 1.781 | 2.603 | 4.16 |
| 4.844335871835299 | 1.81 | 2.682 | 4.379 |
| 4.847477464488889 | 1.839 | 2.764 | 4.614 |
| 4.850619057142478 | 1.869 | 2.851 | 4.87 |
| 4.853760649796068 | 1.9 | 2.941 | 5.147 |
| 4.856902242449657 | 1.932 | 3.036 | 5.448 |
| 4.860043835103247 | 1.964 | 3.135 | 5.777 |
| 4.863185427756837 | 1.997 | 3.239 | 6.137 |
| 4.866327020410426 | 2.031 | 3.349 | 6.531 |
| 4.869468613064015 | 2.066 | 3.464 | 6.964 |
| 4.872610205717605 | 2.102 | 3.585 | 7.443 |
| 4.875751798371195 | 2.138 | 3.713 | 7.972 |
| 4.878893391024784 | 2.176 | 3.847 | 8.561 |
| 4.882034983678374 | 2.215 | 3.989 | 9.217 |
| 4.885176576331964 | 2.254 | 4.139 | 9.951 |
| 4.888318168985553 | 2.295 | 4.298 | 10.777 |
| 4.891459761639143 | 2.336 | 4.466 | 11.711 |
| 4.894601354292733 | 2.379 | 4.643 | 12.773 |
| 4.897742946946322 | 2.423 | 4.832 | 13.985 |
| 4.900884539599912 | 2.468 | 5.033 | 15.38 |
| 4.904026132253501 | 2.515 | 5.246 | 16.994 |
| 4.907167724907091 | 2.562 | 5.473 | 18.878 |
| 4.91030931756068 | 2.611 | 5.716 | 21.095 |
| 4.91345091021427 | 2.662 | 5.975 | 23.727 |
| 4.91659250286786 | 2.714 | 6.252 | 26.886 |
| 4.91973409552145 | 2.767 | 6.548 | 30.723 |
| 4.922875688175039 | 2.822 | 6.867 | 35.446 |
| 4.926017280828628 | 2.879 | 7.209 | 41.353 |
| 4.929158873482218 | 2.937 | 7.578 | 48.873 |
| 4.932300466135808 | 2.997 | 7.975 | 58.655 |
| 4.935442058789397 | 3.059 | 8.405 | 71.705 |
| 4.938583651442987 | 3.123 | 8.871 | 89.663 |
| 4.941725244096576 | 3.189 | 9.377 | 115.34 |
| 4.944866836750166 | 3.257 | 9.928 | 153.891 |
| 4.948008429403755 | 3.327 | 10.529 | 215.627 |
| 4.951150022057345 | 3.399 | 11.187 | 323.706 |
| 4.954291614710935 | 3.474 | 11.908 | 539.519 |
| 4.957433207364524 | 3.551 | 12.702 | 1073.948 |
| 4.960574800018114 | 3.631 | 13.578 | 3097.615 |
| 4.963716392671704 | 3.714 | 14.549 | 34161.462 |
| 4.966857985325293 | 3.799 | 15.629 | 19524.47 |
| 4.969999577978883 | 3.887 | 16.834 | 2567.825 |
| 4.973141170632472 | 3.979 | 18.184 | 957.192 |
| 4.976282763286062 | 4.073 | 19.705 | 495.563 |
| 4.979424355939651 | 4.172 | 21.426 | 302.129 |
| 4.982565948593241 | 4.273 | 23.384 | 203.193 |
| 4.985707541246831 | 4.379 | 25.624 | 145.91 |
| 4.98884913390042 | 4.488 | 28.205 | 109.804 |
| 4.99199072655401 | 4.602 | 31.198 | 85.593 |
| 4.9951323192076 | 4.72 | 34.697 | 68.574 |
| 4.99827391186119 | 4.842 | 38.822 | 56.158 |
| 5.00141550451478 | 4.97 | 43.733 | 46.824 |
| 5.004557097168369 | 5.102 | 49.644 | 39.631 |
| 5.007698689821958 | 5.24 | 56.846 | 33.971 |
| 5.010840282475548 | 5.384 | 65.744 | 29.438 |
| 5.013981875129137 | 5.534 | 76.918 | 25.751 |
| 5.017123467782727 | 5.69 | 91.216 | 22.713 |
| 5.020265060436317 | 5.852 | 109.925 | 20.18 |
| 5.023406653089906 | 6.022 | 135.066 | 18.046 |
| 5.026548245743496 | 6.2 | 169.971 | 16.231 |
| 5.029689838397085 | 6.385 | 220.443 | 14.675 |
| 5.032831431050674 | 6.579 | 297.342 | 13.331 |
| 5.035973023704264 | 6.782 | 422.967 | 12.162 |
| 5.039114616357854 | 6.994 | 649.269 | 11.139 |
| 5.042256209011444 | 7.217 | 1121.742 | 10.239 |
| 5.045397801665033 | 7.451 | 2388.869 | 9.442 |
| 5.048539394318622 | 7.696 | 8186.375 | 8.735 |
| 5.051680986972213 | 7.954 | 374285.39 | 8.103 |
| 5.054822579625802 | 8.225 | 16463.282 | 7.536 |
| 5.057964172279392 | 8.51 | 3367.454 | 7.026 |
| 5.061105764932981 | 8.811 | 1404.605 | 6.566 |
| 5.064247357586571 | 9.128 | 765.506 | 6.149 |
| 5.067388950240161 | 9.462 | 480.595 | 5.77 |
| 5.07053054289375 | 9.816 | 329.392 | 5.424 |
| 5.07367213554734 | 10.189 | 239.667 | 5.108 |
| 5.07681372820093 | 10.585 | 182.113 | 4.818 |
| 5.079955320854519 | 11.005 | 143.008 | 4.552 |
| 5.083096913508108 | 11.45 | 115.238 | 4.307 |
| 5.086238506161698 | 11.924 | 94.813 | 4.081 |
| 5.089380098815288 | 12.427 | 79.355 | 3.872 |
| 5.092521691468877 | 12.964 | 67.376 | 3.678 |
| 5.095663284122466 | 13.536 | 57.907 | 3.499 |
| 5.098804876776057 | 14.148 | 50.292 | 3.331 |
| 5.101946469429646 | 14.803 | 44.078 | 3.176 |
| 5.105088062083236 | 15.504 | 38.941 | 3.03 |
| 5.108229654736825 | 16.258 | 34.647 | 2.894 |
| 5.111371247390415 | 17.068 | 31.021 | 2.767 |
| 5.114512840044005 | 17.942 | 27.931 | 2.648 |
| 5.117654432697594 | 18.885 | 25.277 | 2.536 |
| 5.120796025351184 | 19.905 | 22.981 | 2.431 |
| 5.123937618004773 | 21.012 | 20.981 | 2.332 |
| 5.127079210658363 | 22.214 | 19.229 | 2.239 |
| 5.130220803311953 | 23.524 | 17.684 | 2.151 |
| 5.133362395965542 | 24.955 | 16.317 | 2.068 |
| 5.136503988619131 | 26.523 | 15.1 | 1.99 |
| 5.13964558127272 | 28.244 | 14.013 | 1.916 |
| 5.142787173926311 | 30.141 | 13.037 | 1.846 |
| 5.1459287665799 | 32.238 | 12.158 | 1.779 |
| 5.14907035923349 | 34.565 | 11.364 | 1.716 |
| 5.15221195188708 | 37.155 | 10.644 | 1.656 |
| 5.15535354454067 | 40.052 | 9.989 | 1.599 |
| 5.158495137194259 | 43.306 | 9.392 | 1.545 |
| 5.161636729847848 | 46.977 | 8.846 | 1.493 |
| 5.164778322501438 | 51.141 | 8.345 | 1.444 |
| 5.167919915155028 | 55.89 | 7.885 | 1.397 |
| 5.171061507808617 | 61.341 | 7.46 | 1.352 |
| 5.174203100462206 | 67.639 | 7.069 | 1.31 |
| 5.177344693115796 | 74.969 | 6.707 | 1.269 |
| 5.180486285769386 | 83.57 | 6.371 | 1.23 |
| 5.183627878422976 | 93.758 | 6.059 | 1.192 |
| 5.186769471076565 | 105.946 | 5.769 | 1.157 |
| 5.189911063730155 | 120.699 | 5.499 | 1.122 |
| 5.193052656383744 | 138.791 | 5.247 | 1.09 |
| 5.196194249037334 | 161.315 | 5.011 | 1.058 |
| 5.199335841690924 | 189.85 | 4.79 | 1.028 |
| 5.202477434344513 | 226.749 | 4.583 | 0.999 |
| 5.205619026998103 | 275.638 | 4.389 | 0.971 |
| 5.208760619651692 | 342.351 | 4.207 | 0.944 |
| 5.211902212305282 | 436.755 | 4.035 | 0.918 |
| 5.215043804958871 | 576.636 | 3.873 | 0.894 |
| 5.218185397612461 | 796.753 | 3.721 | 0.87 |
| 5.221326990266051 | 1172.783 | 3.577 | 0.847 |
| 5.22446858291964 | 1896.414 | 3.44 | 0.825 |
| 5.22761017557323 | 3579.114 | 3.312 | 0.803 |
| 5.23075176822682 | 9146.285 | 3.19 | 0.783 |
| 5.23389336088041 | 57061.894 | 3.074 | 0.763 |
| 5.237034953533999 | 227834.644 | 2.964 | 0.744 |
| 5.240176546187588 | 14213.646 | 2.86 | 0.725 |
| 5.243318138841178 | 4632.626 | 2.761 | 0.707 |
| 5.246459731494767 | 2265.756 | 2.666 | 0.69 |
| 5.249601324148357 | 1338.161 | 2.577 | 0.673 |
| 5.252742916801947 | 881.716 | 2.491 | 0.657 |
| 5.255884509455536 | 624.062 | 2.41 | 0.642 |
| 5.259026102109125 | 464.566 | 2.332 | 0.627 |
| 5.262167694762715 | 359.056 | 2.257 | 0.612 |
| 5.265309287416305 | 285.672 | 2.186 | 0.598 |
| 5.268450880069895 | 232.591 | 2.118 | 0.584 |
| 5.271592472723484 | 192.967 | 2.054 | 0.571 |
| 5.274734065377074 | 162.613 | 1.991 | 0.558 |
| 5.277875658030664 | 138.85 | 1.932 | 0.545 |
| 5.281017250684253 | 119.903 | 1.875 | 0.533 |
| 5.284158843337843 | 104.554 | 1.82 | 0.522 |
| 5.287300435991432 | 91.949 | 1.767 | 0.51 |
| 5.290442028645022 | 81.472 | 1.717 | 0.499 |
| 5.293583621298612 | 72.67 | 1.668 | 0.488 |
| 5.296725213952201 | 65.205 | 1.622 | 0.478 |
| 5.299866806605791 | 58.82 | 1.577 | 0.468 |
| 5.30300839925938 | 53.317 | 1.534 | 0.458 |
| 5.30614999191297 | 48.541 | 1.492 | 0.448 |
| 5.30929158456656 | 44.37 | 1.453 | 0.439 |
| 5.312433177220149 | 40.705 | 1.414 | 0.43 |
| 5.315574769873739 | 37.469 | 1.377 | 0.421 |
| 5.318716362527328 | 34.597 | 1.341 | 0.413 |
| 5.321857955180918 | 32.037 | 1.307 | 0.404 |
| 5.324999547834508 | 29.746 | 1.273 | 0.396 |
| 5.328141140488097 | 27.686 | 1.241 | 0.388 |
| 5.331282733141686 | 25.829 | 1.21 | 0.38 |
| 5.334424325795276 | 24.148 | 1.18 | 0.373 |
| 5.337565918448866 | 22.622 | 1.151 | 0.366 |
| 5.340707511102456 | 21.233 | 1.123 | 0.359 |
| 5.343849103756045 | 19.965 | 1.096 | 0.352 |
| 5.346990696409634 | 18.803 | 1.07 | 0.345 |
| 5.350132289063224 | 17.738 | 1.044 | 0.338 |
| 5.353273881716814 | 16.758 | 1.02 | 0.332 |
| 5.356415474370403 | 15.854 | 0.996 | 0.325 |
| 5.359557067023993 | 15.019 | 0.973 | 0.319 |
| 5.362698659677583 | 14.246 | 0.951 | 0.313 |
| 5.365840252331172 | 13.53 | 0.929 | 0.308 |
| 5.368981844984762 | 12.864 | 0.908 | 0.302 |
| 5.372123437638351 | 12.244 | 0.888 | 0.296 |
| 5.375265030291941 | 11.666 | 0.868 | 0.291 |
| 5.378406622945531 | 11.127 | 0.849 | 0.286 |
| 5.38154821559912 | 10.623 | 0.83 | 0.28 |
| 5.38468980825271 | 10.15 | 0.812 | 0.275 |
| 5.387831400906299 | 9.707 | 0.794 | 0.27 |
| 5.39097299355989 | 9.292 | 0.777 | 0.266 |
| 5.394114586213479 | 8.901 | 0.76 | 0.261 |
| 5.397256178867068 | 8.533 | 0.744 | 0.256 |
| 5.400397771520657 | 8.186 | 0.729 | 0.252 |
| 5.403539364174247 | 7.859 | 0.713 | 0.247 |
| 5.406680956827837 | 7.55 | 0.699 | 0.243 |
| 5.409822549481426 | 7.258 | 0.684 | 0.239 |
| 5.412964142135016 | 6.982 | 0.67 | 0.235 |
| 5.416105734788605 | 6.72 | 0.656 | 0.23 |
| 5.419247327442195 | 6.472 | 0.643 | 0.226 |
| 5.422388920095785 | 6.237 | 0.63 | 0.223 |
| 5.425530512749375 | 6.013 | 0.617 | 0.219 |
| 5.428672105402964 | 5.801 | 0.605 | 0.215 |
| 5.431813698056554 | 5.598 | 0.593 | 0.211 |
| 5.434955290710143 | 5.406 | 0.581 | 0.208 |
| 5.438096883363733 | 5.222 | 0.57 | 0.204 |
| 5.441238476017322 | 5.047 | 0.559 | 0.201 |
| 5.444380068670912 | 4.881 | 0.548 | 0.198 |
| 5.447521661324502 | 4.721 | 0.537 | 0.194 |
| 5.450663253978091 | 4.569 | 0.527 | 0.191 |
| 5.453804846631681 | 4.423 | 0.517 | 0.188 |
| 5.456946439285271 | 4.284 | 0.507 | 0.185 |
| 5.46008803193886 | 4.151 | 0.497 | 0.182 |
| 5.46322962459245 | 4.023 | 0.488 | 0.179 |
| 5.466371217246039 | 3.901 | 0.479 | 0.176 |
| 5.46951280989963 | 3.783 | 0.47 | 0.173 |
| 5.472654402553218 | 3.671 | 0.461 | 0.17 |
| 5.475795995206808 | 3.563 | 0.452 | 0.167 |
| 5.478937587860398 | 3.459 | 0.444 | 0.165 |
| 5.482079180513987 | 3.359 | 0.436 | 0.162 |
| 5.485220773167577 | 3.263 | 0.428 | 0.159 |
| 5.488362365821166 | 3.171 | 0.42 | 0.157 |
| 5.491503958474756 | 3.082 | 0.412 | 0.154 |
| 5.494645551128346 | 2.997 | 0.405 | 0.152 |
| 5.497787143781935 | 2.914 | 0.398 | 0.15 |
| 5.500928736435525 | 2.835 | 0.391 | 0.147 |
| 5.504070329089115 | 2.758 | 0.384 | 0.145 |
| 5.507211921742704 | 2.685 | 0.377 | 0.143 |
| 5.510353514396294 | 2.613 | 0.37 | 0.14 |
| 5.513495107049883 | 2.545 | 0.363 | 0.138 |
| 5.516636699703473 | 2.478 | 0.357 | 0.136 |
| 5.519778292357062 | 2.414 | 0.351 | 0.134 |
| 5.522919885010652 | 2.352 | 0.345 | 0.132 |
| 5.526061477664242 | 2.292 | 0.339 | 0.13 |
| 5.529203070317831 | 2.235 | 0.333 | 0.128 |
| 5.532344662971421 | 2.179 | 0.327 | 0.126 |
| 5.535486255625011 | 2.124 | 0.321 | 0.124 |
| 5.5386278482786 | 2.072 | 0.316 | 0.122 |
| 5.54176944093219 | 2.021 | 0.31 | 0.12 |
| 5.544911033585779 | 1.972 | 0.305 | 0.118 |
| 5.54805262623937 | 1.924 | 0.3 | 0.116 |
| 5.551194218892959 | 1.878 | 0.295 | 0.114 |
| 5.554335811546548 | 1.833 | 0.289 | 0.113 |
| 5.557477404200137 | 1.79 | 0.285 | 0.111 |
| 5.560618996853727 | 1.748 | 0.28 | 0.109 |
| 5.563760589507317 | 1.707 | 0.275 | 0.108 |
| 5.566902182160906 | 1.667 | 0.27 | 0.106 |
| 5.570043774814496 | 1.629 | 0.266 | 0.104 |
| 5.573185367468086 | 1.591 | 0.261 | 0.103 |
| 5.576326960121675 | 1.555 | 0.257 | 0.101 |
| 5.579468552775264 | 1.52 | 0.253 | 0.1 |
| 5.582610145428854 | 1.485 | 0.248 | 0.098 |
| 5.585751738082444 | 1.452 | 0.244 | 0.097 |
| 5.588893330736034 | 1.42 | 0.24 | 0.095 |
| 5.592034923389623 | 1.388 | 0.236 | 0.094 |
| 5.595176516043213 | 1.357 | 0.232 | 0.092 |
| 5.598318108696803 | 1.328 | 0.228 | 0.091 |
| 5.601459701350392 | 1.299 | 0.225 | 0.09 |
| 5.604601294003982 | 1.27 | 0.221 | 0.088 |
| 5.607742886657571 | 1.243 | 0.217 | 0.087 |
| 5.610884479311161 | 1.216 | 0.214 | 0.086 |
| 5.61402607196475 | 1.19 | 0.21 | 0.084 |
| 5.61716766461834 | 1.164 | 0.207 | 0.083 |
| 5.62030925727193 | 1.14 | 0.203 | 0.082 |
| 5.623450849925519 | 1.115 | 0.2 | 0.08 |
| 5.626592442579109 | 1.092 | 0.197 | 0.079 |
| 5.629734035232698 | 1.069 | 0.194 | 0.078 |
| 5.632875627886288 | 1.047 | 0.19 | 0.077 |
| 5.636017220539878 | 1.025 | 0.187 | 0.076 |
| 5.639158813193467 | 1.004 | 0.184 | 0.075 |
| 5.642300405847057 | 0.983 | 0.181 | 0.073 |
| 5.645441998500646 | 0.962 | 0.178 | 0.072 |
| 5.648583591154236 | 0.943 | 0.175 | 0.071 |
| 5.651725183807825 | 0.923 | 0.172 | 0.07 |
| 5.654866776461415 | 0.905 | 0.17 | 0.069 |
| 5.658008369115005 | 0.886 | 0.167 | 0.068 |
| 5.661149961768594 | 0.868 | 0.164 | 0.067 |
| 5.664291554422184 | 0.851 | 0.162 | 0.066 |
| 5.667433147075774 | 0.833 | 0.159 | 0.065 |
| 5.670574739729363 | 0.817 | 0.156 | 0.064 |
| 5.673716332382953 | 0.8 | 0.154 | 0.063 |
| 5.676857925036542 | 0.784 | 0.151 | 0.062 |
| 5.679999517690132 | 0.769 | 0.149 | 0.061 |
| 5.683141110343721 | 0.753 | 0.146 | 0.06 |
| 5.686282702997311 | 0.738 | 0.144 | 0.059 |
| 5.689424295650901 | 0.724 | 0.142 | 0.058 |
| 5.69256588830449 | 0.709 | 0.139 | 0.057 |
| 5.69570748095808 | 0.695 | 0.137 | 0.057 |
| 5.69884907361167 | 0.682 | 0.135 | 0.056 |
| 5.701990666265259 | 0.668 | 0.133 | 0.055 |
| 5.705132258918849 | 0.655 | 0.13 | 0.054 |
| 5.708273851572438 | 0.642 | 0.128 | 0.053 |
| 5.711415444226028 | 0.63 | 0.126 | 0.052 |
| 5.714557036879618 | 0.617 | 0.124 | 0.052 |
| 5.717698629533207 | 0.605 | 0.122 | 0.051 |
| 5.720840222186797 | 0.594 | 0.12 | 0.05 |
| 5.723981814840386 | 0.582 | 0.118 | 0.049 |
| 5.727123407493976 | 0.571 | 0.116 | 0.048 |
| 5.730265000147565 | 0.56 | 0.114 | 0.048 |
| 5.733406592801155 | 0.549 | 0.112 | 0.047 |
| 5.736548185454744 | 0.538 | 0.111 | 0.046 |
| 5.739689778108334 | 0.528 | 0.109 | 0.046 |
| 5.742831370761924 | 0.518 | 0.107 | 0.045 |
| 5.745972963415514 | 0.508 | 0.105 | 0.044 |
| 5.749114556069103 | 0.498 | 0.104 | 0.043 |
| 5.752256148722693 | 0.488 | 0.102 | 0.043 |
| 5.755397741376282 | 0.479 | 0.1 | 0.042 |
| 5.758539334029872 | 0.47 | 0.098 | 0.041 |
| 5.761680926683462 | 0.46 | 0.097 | 0.041 |
| 5.764822519337051 | 0.452 | 0.095 | 0.04 |
| 5.767964111990641 | 0.443 | 0.094 | 0.039 |
| 5.77110570464423 | 0.434 | 0.092 | 0.039 |
| 5.77424729729782 | 0.426 | 0.09 | 0.038 |
| 5.77738888995141 | 0.418 | 0.089 | 0.038 |
| 5.780530482605 | 0.41 | 0.087 | 0.037 |
| 5.783672075258588 | 0.402 | 0.086 | 0.036 |
| 5.786813667912178 | 0.394 | 0.085 | 0.036 |
| 5.789955260565768 | 0.386 | 0.083 | 0.035 |
| 5.793096853219358 | 0.379 | 0.082 | 0.035 |
| 5.796238445872947 | 0.372 | 0.08 | 0.034 |
| 5.799380038526537 | 0.364 | 0.079 | 0.034 |
| 5.802521631180126 | 0.357 | 0.078 | 0.033 |
| 5.805663223833715 | 0.351 | 0.076 | 0.032 |
| 5.808804816487306 | 0.344 | 0.075 | 0.032 |
| 5.811946409140895 | 0.337 | 0.074 | 0.031 |
| 5.815088001794485 | 0.33 | 0.072 | 0.031 |
| 5.818229594448074 | 0.324 | 0.071 | 0.03 |
| 5.821371187101663 | 0.318 | 0.07 | 0.03 |
| 5.824512779755254 | 0.312 | 0.069 | 0.029 |
| 5.827654372408843 | 0.305 | 0.067 | 0.029 |
| 5.830795965062433 | 0.299 | 0.066 | 0.028 |
| 5.833937557716022 | 0.294 | 0.065 | 0.028 |
| 5.837079150369612 | 0.288 | 0.064 | 0.027 |
| 5.840220743023201 | 0.282 | 0.063 | 0.027 |
| 5.843362335676791 | 0.277 | 0.062 | 0.026 |
| 5.846503928330381 | 0.271 | 0.061 | 0.026 |
| 5.84964552098397 | 0.266 | 0.059 | 0.026 |
| 5.85278711363756 | 0.26 | 0.058 | 0.025 |
| 5.85592870629115 | 0.255 | 0.057 | 0.025 |
| 5.85907029894474 | 0.25 | 0.056 | 0.024 |
| 5.862211891598329 | 0.245 | 0.055 | 0.024 |
| 5.865353484251918 | 0.24 | 0.054 | 0.023 |
| 5.868495076905508 | 0.235 | 0.053 | 0.023 |
| 5.871636669559098 | 0.231 | 0.052 | 0.023 |
| 5.874778262212687 | 0.226 | 0.051 | 0.022 |
| 5.877919854866277 | 0.221 | 0.05 | 0.022 |
| 5.881061447519866 | 0.217 | 0.049 | 0.021 |
| 5.884203040173456 | 0.212 | 0.048 | 0.021 |
| 5.887344632827046 | 0.208 | 0.048 | 0.021 |
| 5.890486225480635 | 0.204 | 0.047 | 0.02 |
| 5.893627818134224 | 0.2 | 0.046 | 0.02 |
| 5.896769410787814 | 0.195 | 0.045 | 0.019 |
| 5.899911003441404 | 0.191 | 0.044 | 0.019 |
| 5.903052596094994 | 0.187 | 0.043 | 0.019 |
| 5.906194188748583 | 0.183 | 0.042 | 0.018 |
| 5.909335781402172 | 0.18 | 0.041 | 0.018 |
| 5.912477374055762 | 0.176 | 0.041 | 0.018 |
| 5.915618966709352 | 0.172 | 0.04 | 0.017 |
| 5.918760559362942 | 0.168 | 0.039 | 0.017 |
| 5.921902152016531 | 0.165 | 0.038 | 0.017 |
| 5.92504374467012 | 0.161 | 0.038 | 0.016 |
| 5.92818533732371 | 0.158 | 0.037 | 0.016 |
| 5.9313269299773 | 0.154 | 0.036 | 0.016 |
| 5.93446852263089 | 0.151 | 0.035 | 0.015 |
| 5.93761011528448 | 0.148 | 0.035 | 0.015 |
| 5.940751707938068 | 0.144 | 0.034 | 0.015 |
| 5.943893300591658 | 0.141 | 0.033 | 0.014 |
| 5.947034893245248 | 0.138 | 0.032 | 0.014 |
| 5.950176485898837 | 0.135 | 0.032 | 0.014 |
| 5.953318078552427 | 0.132 | 0.031 | 0.014 |
| 5.956459671206017 | 0.129 | 0.03 | 0.013 |
| 5.959601263859606 | 0.126 | 0.03 | 0.013 |
| 5.962742856513196 | 0.123 | 0.029 | 0.013 |
| 5.965884449166785 | 0.12 | 0.028 | 0.012 |
| 5.969026041820375 | 0.117 | 0.028 | 0.012 |
| 5.972167634473964 | 0.115 | 0.027 | 0.012 |
| 5.975309227127554 | 0.112 | 0.027 | 0.012 |
| 5.978450819781144 | 0.109 | 0.026 | 0.011 |
| 5.981592412434733 | 0.107 | 0.025 | 0.011 |
| 5.984734005088323 | 0.104 | 0.025 | 0.011 |
| 5.987875597741913 | 0.102 | 0.024 | 0.011 |
| 5.991017190395502 | 0.099 | 0.024 | 0.01 |
| 5.994158783049092 | 0.097 | 0.023 | 0.01 |
| 5.997300375702681 | 0.094 | 0.023 | 0.01 |
| 6.000441968356271 | 0.092 | 0.022 | 0.01 |
| 6.003583561009861 | 0.09 | 0.021 | 0.009 |
| 6.00672515366345 | 0.087 | 0.021 | 0.009 |
| 6.00986674631704 | 0.085 | 0.02 | 0.009 |
| 6.01300833897063 | 0.083 | 0.02 | 0.009 |
| 6.01614993162422 | 0.081 | 0.019 | 0.009 |
| 6.019291524277808 | 0.079 | 0.019 | 0.008 |
| 6.022433116931398 | 0.076 | 0.018 | 0.008 |
| 6.025574709584988 | 0.074 | 0.018 | 0.008 |
| 6.028716302238577 | 0.072 | 0.017 | 0.008 |
| 6.031857894892167 | 0.07 | 0.017 | 0.007 |
| 6.034999487545757 | 0.068 | 0.017 | 0.007 |
| 6.038141080199346 | 0.067 | 0.016 | 0.007 |
| 6.041282672852935 | 0.065 | 0.016 | 0.007 |
| 6.044424265506525 | 0.063 | 0.015 | 0.007 |
| 6.047565858160115 | 0.061 | 0.015 | 0.007 |
| 6.050707450813704 | 0.059 | 0.014 | 0.006 |
| 6.053849043467294 | 0.058 | 0.014 | 0.006 |
| 6.056990636120884 | 0.056 | 0.014 | 0.006 |
| 6.060132228774473 | 0.054 | 0.013 | 0.006 |
| 6.063273821428063 | 0.053 | 0.013 | 0.006 |
| 6.066415414081653 | 0.051 | 0.012 | 0.005 |
| 6.069557006735242 | 0.049 | 0.012 | 0.005 |
| 6.072698599388831 | 0.048 | 0.012 | 0.005 |
| 6.07584019204242 | 0.046 | 0.011 | 0.005 |
| 6.078981784696011 | 0.045 | 0.011 | 0.005 |
| 6.082123377349601 | 0.043 | 0.011 | 0.005 |
| 6.08526497000319 | 0.042 | 0.01 | 0.005 |
| 6.08840656265678 | 0.04 | 0.01 | 0.004 |
| 6.09154815531037 | 0.039 | 0.01 | 0.004 |
| 6.094689747963959 | 0.038 | 0.009 | 0.004 |
| 6.097831340617549 | 0.036 | 0.009 | 0.004 |
| 6.100972933271138 | 0.035 | 0.009 | 0.004 |
| 6.104114525924728 | 0.034 | 0.008 | 0.004 |
| 6.107256118578317 | 0.033 | 0.008 | 0.004 |
| 6.110397711231907 | 0.031 | 0.008 | 0.003 |
| 6.113539303885497 | 0.03 | 0.007 | 0.003 |
| 6.116680896539086 | 0.029 | 0.007 | 0.003 |
| 6.119822489192675 | 0.028 | 0.007 | 0.003 |
| 6.122964081846265 | 0.027 | 0.007 | 0.003 |
| 6.126105674499855 | 0.026 | 0.006 | 0.003 |
| 6.129247267153445 | 0.025 | 0.006 | 0.003 |
| 6.132388859807034 | 0.024 | 0.006 | 0.003 |
| 6.135530452460624 | 0.023 | 0.006 | 0.002 |
| 6.138672045114213 | 0.022 | 0.005 | 0.002 |
| 6.141813637767803 | 0.021 | 0.005 | 0.002 |
| 6.144955230421393 | 0.02 | 0.005 | 0.002 |
| 6.148096823074982 | 0.019 | 0.005 | 0.002 |
| 6.151238415728571 | 0.018 | 0.004 | 0.002 |
| 6.154380008382161 | 0.017 | 0.004 | 0.002 |
| 6.157521601035751 | 0.016 | 0.004 | 0.002 |
| 6.16066319368934 | 0.015 | 0.004 | 0.002 |
| 6.16380478634293 | 0.015 | 0.004 | 0.002 |
| 6.16694637899652 | 0.014 | 0.003 | 0.002 |
| 6.170087971650109 | 0.013 | 0.003 | 0.001 |
| 6.173229564303698 | 0.012 | 0.003 | 0.001 |
| 6.176371156957289 | 0.012 | 0.003 | 0.001 |
| 6.179512749610878 | 0.011 | 0.003 | 0.001 |
| 6.182654342264468 | 0.01 | 0.003 | 0.001 |
| 6.185795934918057 | 0.01 | 0.002 | 0.001 |
| 6.188937527571647 | 0.009 | 0.002 | 0.001 |
| 6.192079120225237 | 0.008 | 0.002 | 0.001 |
| 6.195220712878826 | 0.008 | 0.002 | 0.001 |
| 6.198362305532415 | 0.007 | 0.002 | 0.001 |
| 6.201503898186005 | 0.007 | 0.002 | 0.001 |
| 6.204645490839594 | 0.006 | 0.002 | 0.001 |
| 6.207787083493184 | 0.006 | 0.001 | 0.001 |
| 6.210928676146774 | 0.005 | 0.001 | 0.001 |
| 6.214070268800364 | 0.005 | 0.001 | 0.001 |
| 6.217211861453953 | 0.004 | 0.001 | 0 |
| 6.220353454107543 | 0.004 | 0.001 | 0 |
| 6.223495046761133 | 0.004 | 0.001 | 0 |
| 6.226636639414722 | 0.003 | 0.001 | 0 |
| 6.229778232068312 | 0.003 | 0.001 | 0 |
| 6.232919824721901 | 0.003 | 0.001 | 0 |
| 6.236061417375491 | 0.002 | 0.001 | 0 |
| 6.23920301002908 | 0.002 | 0 | 0 |
| 6.24234460268267 | 0.002 | 0 | 0 |
| 6.24548619533626 | 0.001 | 0 | 0 |
| 6.24862778798985 | 0.001 | 0 | 0 |
| 6.251769380643438 | 0.001 | 0 | 0 |
| 6.254910973297028 | 0.001 | 0 | 0 |
| 6.258052565950618 | 0.001 | 0 | 0 |
| 6.261194158604208 | 0 | 0 | 0 |
| 6.264335751257797 | 0 | 0 | 0 |
| 6.267477343911387 | 0 | 0 | 0 |
| 6.270618936564976 | 0 | 0 | 0 |
| 6.273760529218566 | 0 | 0 | 0 |
| 6.276902121872155 | 0 | 0 | 0 |
| 6.280043714525745 | 0 | 0 | 0 |
| 6.283185307179335 | 0 | 0 | 0 |